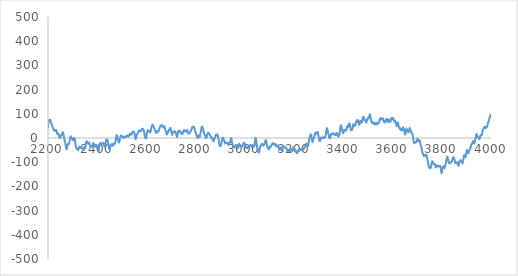
| Category | Series 0 |
|---|---|
| 2200.0 | 41.215 |
| 2200.489 | 45.084 |
| 2200.977 | 50.149 |
| 2201.466 | 56.222 |
| 2201.954 | 61.489 |
| 2202.443 | 64.515 |
| 2202.931 | 66.173 |
| 2203.42 | 68.589 |
| 2203.9080000000004 | 71.45 |
| 2204.397 | 73.194 |
| 2204.8849999999998 | 73.507 |
| 2205.374 | 73.079 |
| 2205.862 | 72.595 |
| 2206.351 | 73.745 |
| 2206.839 | 74.776 |
| 2207.328 | 74.378 |
| 2207.816 | 74.487 |
| 2208.305 | 74.729 |
| 2208.793 | 75.166 |
| 2209.282 | 75.548 |
| 2209.77 | 74.437 |
| 2210.259 | 71.834 |
| 2210.7470000000003 | 69.488 |
| 2211.236 | 67.837 |
| 2211.724 | 65.944 |
| 2212.213 | 64.995 |
| 2212.701 | 64.929 |
| 2213.19 | 63.246 |
| 2213.678 | 61.194 |
| 2214.167 | 59.338 |
| 2214.6549999999997 | 56.926 |
| 2215.144 | 54.896 |
| 2215.632 | 53.374 |
| 2216.121 | 52.734 |
| 2216.609 | 51.164 |
| 2217.098 | 49.851 |
| 2217.5860000000002 | 48.358 |
| 2218.075 | 47.809 |
| 2218.563 | 46.518 |
| 2219.052 | 45.109 |
| 2219.54 | 43.957 |
| 2220.029 | 42.5 |
| 2220.518 | 40.737 |
| 2221.006 | 38.731 |
| 2221.495 | 37.858 |
| 2221.9829999999997 | 37.054 |
| 2222.4719999999998 | 36.445 |
| 2222.96 | 34.468 |
| 2223.449 | 33.56 |
| 2223.937 | 33.034 |
| 2224.426 | 32.828 |
| 2224.9139999999998 | 33.816 |
| 2225.4030000000002 | 32.187 |
| 2225.891 | 30.001 |
| 2226.38 | 29.573 |
| 2226.868 | 30.652 |
| 2227.357 | 31.55 |
| 2227.8450000000003 | 31.83 |
| 2228.3340000000003 | 32.742 |
| 2228.822 | 32.098 |
| 2229.3109999999997 | 32.149 |
| 2229.799 | 33.019 |
| 2230.288 | 32.708 |
| 2230.776 | 31.842 |
| 2231.265 | 30.17 |
| 2231.7529999999997 | 30.379 |
| 2232.242 | 31.721 |
| 2232.73 | 32.132 |
| 2233.219 | 32.549 |
| 2233.707 | 32.036 |
| 2234.196 | 30.092 |
| 2234.684 | 28.717 |
| 2235.1730000000002 | 26.974 |
| 2235.661 | 25.05 |
| 2236.15 | 23.633 |
| 2236.638 | 20.597 |
| 2237.127 | 18.193 |
| 2237.6150000000002 | 17.733 |
| 2238.104 | 16.592 |
| 2238.5919999999996 | 16.458 |
| 2239.081 | 17.33 |
| 2239.569 | 18.084 |
| 2240.058 | 18.22 |
| 2240.547 | 17.174 |
| 2241.035 | 16.885 |
| 2241.524 | 17.29 |
| 2242.012 | 17.889 |
| 2242.501 | 17.744 |
| 2242.989 | 15.856 |
| 2243.478 | 13.725 |
| 2243.966 | 12.224 |
| 2244.455 | 11.231 |
| 2244.943 | 9.556 |
| 2245.4320000000002 | 7.512 |
| 2245.92 | 5.475 |
| 2246.4089999999997 | 3.382 |
| 2246.897 | 1.67 |
| 2247.386 | 0.277 |
| 2247.874 | -0.048 |
| 2248.363 | 0.697 |
| 2248.851 | 0.573 |
| 2249.34 | 1.267 |
| 2249.828 | 2.343 |
| 2250.317 | 2.863 |
| 2250.805 | 4.701 |
| 2251.294 | 6.733 |
| 2251.782 | 9.209 |
| 2252.271 | 10.066 |
| 2252.759 | 9.742 |
| 2253.248 | 10.111 |
| 2253.736 | 10.424 |
| 2254.2250000000004 | 10.681 |
| 2254.713 | 11.381 |
| 2255.2019999999998 | 12.212 |
| 2255.69 | 14.3 |
| 2256.179 | 15.519 |
| 2256.667 | 15.931 |
| 2257.156 | 16.724 |
| 2257.644 | 18.023 |
| 2258.133 | 20.078 |
| 2258.621 | 22.14 |
| 2259.11 | 23.457 |
| 2259.599 | 22.968 |
| 2260.087 | 23.235 |
| 2260.576 | 23.445 |
| 2261.0640000000003 | 22.599 |
| 2261.553 | 21.071 |
| 2262.041 | 18.737 |
| 2262.5299999999997 | 16.846 |
| 2263.018 | 13.586 |
| 2263.507 | 10.144 |
| 2263.995 | 8.146 |
| 2264.484 | 6.403 |
| 2264.9719999999998 | 4.354 |
| 2265.461 | 1.811 |
| 2265.949 | -1.664 |
| 2266.438 | -4.133 |
| 2266.926 | -5.721 |
| 2267.415 | -8.241 |
| 2267.9030000000002 | -10.755 |
| 2268.392 | -12.451 |
| 2268.88 | -13.829 |
| 2269.369 | -15.389 |
| 2269.857 | -18.067 |
| 2270.346 | -20.99 |
| 2270.8340000000003 | -24.345 |
| 2271.323 | -27.569 |
| 2271.8109999999997 | -29.725 |
| 2272.2999999999997 | -32.125 |
| 2272.788 | -34.77 |
| 2273.277 | -37.284 |
| 2273.765 | -40.855 |
| 2274.254 | -43.483 |
| 2274.742 | -45.667 |
| 2275.2309999999998 | -46.596 |
| 2275.719 | -46.645 |
| 2276.208 | -46 |
| 2276.696 | -44.475 |
| 2277.185 | -41.882 |
| 2277.6730000000002 | -38.846 |
| 2278.1620000000003 | -36.929 |
| 2278.65 | -34.319 |
| 2279.139 | -31.016 |
| 2279.6279999999997 | -29.333 |
| 2280.116 | -27.457 |
| 2280.605 | -26.076 |
| 2281.093 | -24.813 |
| 2281.582 | -24.046 |
| 2282.0699999999997 | -24.773 |
| 2282.559 | -25.807 |
| 2283.047 | -24.399 |
| 2283.536 | -23.922 |
| 2284.024 | -23.752 |
| 2284.513 | -24.578 |
| 2285.001 | -23.96 |
| 2285.4900000000002 | -21.775 |
| 2285.978 | -19.584 |
| 2286.467 | -18.638 |
| 2286.955 | -17.249 |
| 2287.444 | -15.792 |
| 2287.9320000000002 | -12.267 |
| 2288.421 | -8.988 |
| 2288.9089999999997 | -6.14 |
| 2289.398 | -3.787 |
| 2289.886 | -1.429 |
| 2290.375 | 0.246 |
| 2290.863 | 2.365 |
| 2291.352 | 4.301 |
| 2291.84 | 6.492 |
| 2292.329 | 6.689 |
| 2292.817 | 6.89 |
| 2293.306 | 5.347 |
| 2293.794 | 4.809 |
| 2294.283 | 4.088 |
| 2294.771 | 3.936 |
| 2295.26 | 2.475 |
| 2295.748 | 1.083 |
| 2296.237 | 1.008 |
| 2296.7250000000004 | -0.688 |
| 2297.214 | -1.627 |
| 2297.7019999999998 | -2.687 |
| 2298.191 | -3.43 |
| 2298.679 | -5.167 |
| 2299.168 | -5.337 |
| 2299.657 | -4.439 |
| 2300.145 | -4.474 |
| 2300.634 | -7.067 |
| 2301.122 | -9.216 |
| 2301.611 | -9.424 |
| 2302.099 | -8.876 |
| 2302.588 | -8.511 |
| 2303.076 | -7.579 |
| 2303.565 | -6.454 |
| 2304.053 | -4.262 |
| 2304.542 | -2.565 |
| 2305.0299999999997 | -1.488 |
| 2305.519 | -1.156 |
| 2306.007 | -0.945 |
| 2306.496 | -0.228 |
| 2306.984 | 0.118 |
| 2307.473 | -0.906 |
| 2307.961 | -1.675 |
| 2308.45 | -2.251 |
| 2308.938 | -5.386 |
| 2309.427 | -10.328 |
| 2309.915 | -15.265 |
| 2310.404 | -17.948 |
| 2310.892 | -20.126 |
| 2311.3810000000003 | -23.549 |
| 2311.869 | -27.217 |
| 2312.358 | -30.193 |
| 2312.846 | -32.415 |
| 2313.335 | -33.757 |
| 2313.823 | -36.031 |
| 2314.312 | -38.801 |
| 2314.7999999999997 | -40.004 |
| 2315.2889999999998 | -40.889 |
| 2315.777 | -41.333 |
| 2316.266 | -42.147 |
| 2316.754 | -44.206 |
| 2317.243 | -45.823 |
| 2317.7309999999998 | -46.81 |
| 2318.2200000000003 | -46.856 |
| 2318.708 | -46.459 |
| 2319.197 | -46.683 |
| 2319.686 | -47.464 |
| 2320.174 | -46.179 |
| 2320.663 | -44.514 |
| 2321.1510000000003 | -44.782 |
| 2321.64 | -46.983 |
| 2322.1279999999997 | -49.179 |
| 2322.6169999999997 | -50.746 |
| 2323.105 | -49.496 |
| 2323.594 | -47.429 |
| 2324.082 | -45.483 |
| 2324.571 | -44.844 |
| 2325.059 | -44.389 |
| 2325.548 | -43.179 |
| 2326.036 | -41.09 |
| 2326.525 | -38.246 |
| 2327.013 | -36.398 |
| 2327.502 | -36.671 |
| 2327.9900000000002 | -37.189 |
| 2328.4790000000003 | -38.14 |
| 2328.967 | -37.9 |
| 2329.456 | -38.467 |
| 2329.944 | -38.718 |
| 2330.433 | -38.402 |
| 2330.921 | -38.706 |
| 2331.41 | -40.069 |
| 2331.898 | -39.802 |
| 2332.3869999999997 | -38.906 |
| 2332.875 | -39.068 |
| 2333.364 | -39.726 |
| 2333.852 | -40.88 |
| 2334.341 | -39.342 |
| 2334.829 | -36.675 |
| 2335.318 | -37.566 |
| 2335.806 | -39.577 |
| 2336.295 | -39.522 |
| 2336.783 | -37.838 |
| 2337.272 | -36.399 |
| 2337.76 | -36.769 |
| 2338.2490000000003 | -37.072 |
| 2338.738 | -37.996 |
| 2339.2259999999997 | -39.416 |
| 2339.715 | -39.394 |
| 2340.203 | -40.181 |
| 2340.692 | -41.963 |
| 2341.18 | -43.616 |
| 2341.669 | -45.265 |
| 2342.157 | -45.973 |
| 2342.646 | -46.676 |
| 2343.134 | -47.438 |
| 2343.623 | -48.196 |
| 2344.111 | -48.012 |
| 2344.6 | -48.324 |
| 2345.088 | -48.382 |
| 2345.577 | -49.561 |
| 2346.065 | -49.298 |
| 2346.554 | -48.032 |
| 2347.042 | -46.323 |
| 2347.531 | -44.799 |
| 2348.019 | -42.708 |
| 2348.508 | -42.175 |
| 2348.996 | -41.701 |
| 2349.485 | -40.223 |
| 2349.973 | -38.116 |
| 2350.462 | -36.38 |
| 2350.95 | -35.139 |
| 2351.439 | -35.083 |
| 2351.927 | -34.148 |
| 2352.416 | -31.833 |
| 2352.904 | -27.828 |
| 2353.393 | -24.068 |
| 2353.8810000000003 | -21.492 |
| 2354.37 | -19.162 |
| 2354.858 | -17.391 |
| 2355.3469999999998 | -16.928 |
| 2355.835 | -16.462 |
| 2356.324 | -15.991 |
| 2356.812 | -14.517 |
| 2357.301 | -13.101 |
| 2357.7889999999998 | -13.87 |
| 2358.278 | -15.259 |
| 2358.767 | -16.457 |
| 2359.255 | -16.588 |
| 2359.744 | -17.091 |
| 2360.232 | -18.59 |
| 2360.721 | -20.086 |
| 2361.209 | -21.077 |
| 2361.6980000000003 | -22.315 |
| 2362.186 | -23.049 |
| 2362.675 | -23.217 |
| 2363.163 | -23.068 |
| 2363.652 | -22.791 |
| 2364.14 | -21.698 |
| 2364.629 | -20.226 |
| 2365.1169999999997 | -19.375 |
| 2365.6059999999998 | -19.52 |
| 2366.094 | -18.725 |
| 2366.583 | -18.925 |
| 2367.071 | -18.747 |
| 2367.56 | -20.128 |
| 2368.048 | -22.818 |
| 2368.5370000000003 | -25.941 |
| 2369.025 | -27.936 |
| 2369.514 | -29.428 |
| 2370.002 | -30.978 |
| 2370.491 | -31.962 |
| 2370.9790000000003 | -33.192 |
| 2371.4680000000003 | -34.357 |
| 2371.956 | -36.08 |
| 2372.4449999999997 | -36.174 |
| 2372.933 | -35.328 |
| 2373.422 | -35.603 |
| 2373.91 | -36.187 |
| 2374.399 | -35.83 |
| 2374.8869999999997 | -35.532 |
| 2375.376 | -36.918 |
| 2375.864 | -37.363 |
| 2376.353 | -37.366 |
| 2376.841 | -36.179 |
| 2377.33 | -35.176 |
| 2377.818 | -34.482 |
| 2378.3070000000002 | -33.347 |
| 2378.7960000000003 | -32.521 |
| 2379.284 | -31.441 |
| 2379.773 | -30.795 |
| 2380.261 | -29.709 |
| 2380.75 | -29.431 |
| 2381.238 | -27.838 |
| 2381.727 | -25.554 |
| 2382.215 | -23.016 |
| 2382.7039999999997 | -21.975 |
| 2383.192 | -21.618 |
| 2383.681 | -21.882 |
| 2384.169 | -21.768 |
| 2384.658 | -21.651 |
| 2385.146 | -21.968 |
| 2385.635 | -23.094 |
| 2386.123 | -24.779 |
| 2386.612 | -28.773 |
| 2387.1 | -31.202 |
| 2387.589 | -32.689 |
| 2388.077 | -33.861 |
| 2388.566 | -35.717 |
| 2389.054 | -35.757 |
| 2389.5429999999997 | -35.732 |
| 2390.031 | -36.203 |
| 2390.52 | -36.858 |
| 2391.008 | -36.51 |
| 2391.497 | -35.283 |
| 2391.985 | -32.929 |
| 2392.474 | -31.759 |
| 2392.962 | -31.085 |
| 2393.451 | -29.908 |
| 2393.939 | -29.54 |
| 2394.428 | -28.982 |
| 2394.916 | -28.545 |
| 2395.405 | -27.543 |
| 2395.893 | -27.538 |
| 2396.382 | -29.404 |
| 2396.87 | -31.704 |
| 2397.359 | -33.377 |
| 2397.8469999999998 | -34.671 |
| 2398.336 | -35.899 |
| 2398.825 | -37.062 |
| 2399.313 | -38.534 |
| 2399.802 | -39.691 |
| 2400.29 | -41.657 |
| 2400.779 | -43.494 |
| 2401.267 | -45.829 |
| 2401.756 | -48.16 |
| 2402.244 | -50.864 |
| 2402.733 | -52.876 |
| 2403.221 | -54.261 |
| 2403.71 | -54.642 |
| 2404.1980000000003 | -55.271 |
| 2404.687 | -55.646 |
| 2405.175 | -55.081 |
| 2405.6639999999998 | -53.825 |
| 2406.152 | -51.066 |
| 2406.641 | -46.804 |
| 2407.129 | -42.539 |
| 2407.618 | -39.271 |
| 2408.1059999999998 | -36.312 |
| 2408.595 | -32.975 |
| 2409.083 | -29.823 |
| 2409.572 | -27.668 |
| 2410.06 | -25.697 |
| 2410.549 | -23.911 |
| 2411.0370000000003 | -23.247 |
| 2411.526 | -22.079 |
| 2412.014 | -21.659 |
| 2412.503 | -21.111 |
| 2412.991 | -20.81 |
| 2413.48 | -21.38 |
| 2413.9680000000003 | -23.198 |
| 2414.457 | -25.076 |
| 2414.9449999999997 | -26.325 |
| 2415.4339999999997 | -25.759 |
| 2415.922 | -24.253 |
| 2416.411 | -23.868 |
| 2416.899 | -25.481 |
| 2417.388 | -25.653 |
| 2417.876 | -25.073 |
| 2418.365 | -24.552 |
| 2418.8540000000003 | -24.528 |
| 2419.342 | -23.876 |
| 2419.831 | -22.596 |
| 2420.319 | -22.376 |
| 2420.808 | -22.653 |
| 2421.2960000000003 | -22.427 |
| 2421.7850000000003 | -22.574 |
| 2422.273 | -22.342 |
| 2422.7619999999997 | -21.733 |
| 2423.25 | -21.933 |
| 2423.739 | -20.818 |
| 2424.227 | -20.137 |
| 2424.716 | -21.079 |
| 2425.2039999999997 | -22.456 |
| 2425.693 | -22.954 |
| 2426.181 | -23.575 |
| 2426.67 | -24.506 |
| 2427.158 | -26.996 |
| 2427.647 | -30.296 |
| 2428.135 | -31.718 |
| 2428.6240000000003 | -32.825 |
| 2429.112 | -33.679 |
| 2429.601 | -35.468 |
| 2430.089 | -36.066 |
| 2430.578 | -34.787 |
| 2431.066 | -32.943 |
| 2431.555 | -31.346 |
| 2432.0429999999997 | -30.933 |
| 2432.532 | -28.143 |
| 2433.02 | -24.038 |
| 2433.509 | -20.555 |
| 2433.997 | -18.569 |
| 2434.486 | -16.393 |
| 2434.974 | -14.214 |
| 2435.463 | -13.345 |
| 2435.951 | -11.349 |
| 2436.44 | -9.599 |
| 2436.928 | -6.973 |
| 2437.417 | -6.593 |
| 2437.906 | -6.586 |
| 2438.3940000000002 | -7.388 |
| 2438.883 | -7.751 |
| 2439.371 | -6.61 |
| 2439.8599999999997 | -6.843 |
| 2440.348 | -7.822 |
| 2440.837 | -8.986 |
| 2441.325 | -9.898 |
| 2441.814 | -10.807 |
| 2442.302 | -11.714 |
| 2442.791 | -13.743 |
| 2443.279 | -16.456 |
| 2443.768 | -18.668 |
| 2444.256 | -22.314 |
| 2444.745 | -26.645 |
| 2445.233 | -29.661 |
| 2445.722 | -32.924 |
| 2446.21 | -36.435 |
| 2446.699 | -39.255 |
| 2447.187 | -41.511 |
| 2447.676 | -43.764 |
| 2448.1639999999998 | -45.015 |
| 2448.653 | -43.95 |
| 2449.141 | -42.633 |
| 2449.63 | -41.876 |
| 2450.118 | -42.366 |
| 2450.607 | -42.104 |
| 2451.095 | -41.84 |
| 2451.584 | -41.573 |
| 2452.072 | -41.178 |
| 2452.561 | -40.281 |
| 2453.049 | -37.881 |
| 2453.538 | -36.104 |
| 2454.026 | -34.012 |
| 2454.5150000000003 | -32.792 |
| 2455.003 | -31.507 |
| 2455.492 | -30.595 |
| 2455.98 | -28.493 |
| 2456.469 | -26.764 |
| 2456.957 | -26.282 |
| 2457.446 | -26.172 |
| 2457.935 | -26.498 |
| 2458.423 | -26.196 |
| 2458.912 | -25.892 |
| 2459.4 | -26.023 |
| 2459.889 | -25.964 |
| 2460.377 | -27.34 |
| 2460.866 | -29.026 |
| 2461.3540000000003 | -29.147 |
| 2461.843 | -29.641 |
| 2462.331 | -30.695 |
| 2462.82 | -31.746 |
| 2463.308 | -32.295 |
| 2463.797 | -32.592 |
| 2464.2850000000003 | -31.948 |
| 2464.774 | -30.615 |
| 2465.2619999999997 | -29.155 |
| 2465.7509999999997 | -28.192 |
| 2466.239 | -26.414 |
| 2466.728 | -24.384 |
| 2467.216 | -22.852 |
| 2467.705 | -21.942 |
| 2468.193 | -21.53 |
| 2468.682 | -21.241 |
| 2469.17 | -22.011 |
| 2469.659 | -22.467 |
| 2470.147 | -22.796 |
| 2470.636 | -22.872 |
| 2471.1240000000003 | -24.196 |
| 2471.6130000000003 | -23.33 |
| 2472.101 | -21.524 |
| 2472.5899999999997 | -19.966 |
| 2473.078 | -18.406 |
| 2473.567 | -17.719 |
| 2474.055 | -16.091 |
| 2474.544 | -13.274 |
| 2475.032 | -9.767 |
| 2475.5209999999997 | -6.008 |
| 2476.009 | -2.434 |
| 2476.498 | 0.517 |
| 2476.986 | 1.721 |
| 2477.475 | 3.864 |
| 2477.964 | 6.509 |
| 2478.452 | 9.845 |
| 2478.9410000000003 | 11.807 |
| 2479.429 | 11.772 |
| 2479.918 | 11.426 |
| 2480.406 | 9.895 |
| 2480.895 | 7.554 |
| 2481.383 | 5.528 |
| 2481.872 | 4.254 |
| 2482.3599999999997 | 1.357 |
| 2482.849 | -1.788 |
| 2483.337 | -4.118 |
| 2483.826 | -5.258 |
| 2484.314 | -6.771 |
| 2484.803 | -8.845 |
| 2485.291 | -11.353 |
| 2485.78 | -12.235 |
| 2486.268 | -12.989 |
| 2486.757 | -14.367 |
| 2487.245 | -16.742 |
| 2487.734 | -18.49 |
| 2488.222 | -18.735 |
| 2488.7110000000002 | -17.666 |
| 2489.199 | -16.158 |
| 2489.688 | -15.397 |
| 2490.176 | -14.509 |
| 2490.665 | -12.244 |
| 2491.153 | -9.039 |
| 2491.642 | -5.77 |
| 2492.13 | -3.374 |
| 2492.619 | -0.725 |
| 2493.107 | 1.175 |
| 2493.596 | 3.391 |
| 2494.084 | 4.046 |
| 2494.573 | 5.578 |
| 2495.061 | 6.862 |
| 2495.55 | 8.773 |
| 2496.038 | 9.874 |
| 2496.527 | 9.727 |
| 2497.0150000000003 | 10.019 |
| 2497.504 | 10.064 |
| 2497.993 | 9.985 |
| 2498.4809999999998 | 9.909 |
| 2498.97 | 8.897 |
| 2499.458 | 7.263 |
| 2499.947 | 7.568 |
| 2500.435 | 8.75 |
| 2500.924 | 9.309 |
| 2501.412 | 7.62 |
| 2501.901 | 5.621 |
| 2502.389 | 4.123 |
| 2502.878 | 4.065 |
| 2503.366 | 4.76 |
| 2503.855 | 4.831 |
| 2504.343 | 3.154 |
| 2504.8320000000003 | 1.605 |
| 2505.32 | 1.432 |
| 2505.809 | 2.949 |
| 2506.297 | 3.093 |
| 2506.786 | 2.802 |
| 2507.274 | 2.95 |
| 2507.763 | 4.099 |
| 2508.2509999999997 | 4.626 |
| 2508.74 | 4.03 |
| 2509.228 | 5.186 |
| 2509.717 | 5.219 |
| 2510.205 | 5.004 |
| 2510.694 | 4.041 |
| 2511.182 | 3.33 |
| 2511.6710000000003 | 2.308 |
| 2512.159 | 1.601 |
| 2512.648 | 1.584 |
| 2513.136 | 2.443 |
| 2513.625 | 2.992 |
| 2514.1130000000003 | 2.855 |
| 2514.602 | 2.658 |
| 2515.0899999999997 | 2.837 |
| 2515.5789999999997 | 4.269 |
| 2516.067 | 5.702 |
| 2516.556 | 6.2 |
| 2517.045 | 7.45 |
| 2517.533 | 7.389 |
| 2518.022 | 7.893 |
| 2518.51 | 8.211 |
| 2518.999 | 7.719 |
| 2519.487 | 7.041 |
| 2519.976 | 8.177 |
| 2520.464 | 9.941 |
| 2520.953 | 10.519 |
| 2521.4410000000003 | 9.848 |
| 2521.9300000000003 | 9.055 |
| 2522.418 | 9.513 |
| 2522.9069999999997 | 9.974 |
| 2523.395 | 9.749 |
| 2523.884 | 8.963 |
| 2524.372 | 8.554 |
| 2524.861 | 8.459 |
| 2525.349 | 7.992 |
| 2525.8379999999997 | 6.463 |
| 2526.326 | 6.124 |
| 2526.815 | 6.037 |
| 2527.303 | 6.202 |
| 2527.792 | 7.306 |
| 2528.28 | 7.225 |
| 2528.7690000000002 | 8.333 |
| 2529.257 | 10.443 |
| 2529.746 | 11.679 |
| 2530.234 | 11.293 |
| 2530.723 | 11.658 |
| 2531.2110000000002 | 12.65 |
| 2531.7 | 13.582 |
| 2532.188 | 14.765 |
| 2532.6769999999997 | 16.138 |
| 2533.165 | 18.137 |
| 2533.654 | 18.076 |
| 2534.142 | 16.955 |
| 2534.631 | 16.085 |
| 2535.119 | 15.654 |
| 2535.608 | 15.1 |
| 2536.096 | 15.11 |
| 2536.585 | 13.81 |
| 2537.074 | 13.824 |
| 2537.562 | 14.778 |
| 2538.051 | 16.67 |
| 2538.539 | 17.065 |
| 2539.0280000000002 | 15.774 |
| 2539.516 | 15.172 |
| 2540.005 | 16.322 |
| 2540.493 | 18.223 |
| 2540.982 | 19.752 |
| 2541.47 | 20.595 |
| 2541.959 | 20.689 |
| 2542.447 | 21.848 |
| 2542.936 | 23.258 |
| 2543.424 | 23.858 |
| 2543.913 | 23.522 |
| 2544.401 | 23.376 |
| 2544.89 | 24.543 |
| 2545.378 | 25.4 |
| 2545.867 | 25.446 |
| 2546.355 | 25.432 |
| 2546.844 | 24.981 |
| 2547.3320000000003 | 24.22 |
| 2547.821 | 24.836 |
| 2548.309 | 25.141 |
| 2548.798 | 26.073 |
| 2549.286 | 26.256 |
| 2549.775 | 24.254 |
| 2550.263 | 22.565 |
| 2550.752 | 20.567 |
| 2551.24 | 18.882 |
| 2551.729 | 17.449 |
| 2552.217 | 14.455 |
| 2552.706 | 10.526 |
| 2553.194 | 6.91 |
| 2553.683 | 3.234 |
| 2554.1710000000003 | 0.81 |
| 2554.66 | -0.988 |
| 2555.148 | -3.221 |
| 2555.637 | -4.39 |
| 2556.125 | -4.37 |
| 2556.614 | -3.849 |
| 2557.103 | -3.513 |
| 2557.591 | -1.175 |
| 2558.08 | 1.164 |
| 2558.5679999999998 | 3.38 |
| 2559.057 | 5.348 |
| 2559.545 | 8.254 |
| 2560.034 | 11.225 |
| 2560.5220000000004 | 13.198 |
| 2561.0109999999995 | 13.797 |
| 2561.499 | 14.336 |
| 2561.9880000000003 | 14.501 |
| 2562.4759999999997 | 16.418 |
| 2562.9649999999997 | 17.149 |
| 2563.453 | 17.944 |
| 2563.942 | 19.804 |
| 2564.43 | 20.79 |
| 2564.919 | 21.528 |
| 2565.407 | 21.892 |
| 2565.896 | 23.32 |
| 2566.384 | 25.063 |
| 2566.873 | 26.245 |
| 2567.3610000000003 | 25.866 |
| 2567.8500000000004 | 25.989 |
| 2568.3379999999997 | 27.175 |
| 2568.827 | 29.801 |
| 2569.3150000000005 | 31.241 |
| 2569.8039999999996 | 30.058 |
| 2570.292 | 29.439 |
| 2570.781 | 29.821 |
| 2571.269 | 30.518 |
| 2571.758 | 30.591 |
| 2572.246 | 29.603 |
| 2572.735 | 27.93 |
| 2573.223 | 27.321 |
| 2573.712 | 27.713 |
| 2574.2000000000003 | 28.357 |
| 2574.6890000000003 | 28.252 |
| 2575.1769999999997 | 27.649 |
| 2575.666 | 28.048 |
| 2576.1540000000005 | 29.073 |
| 2576.643 | 30.037 |
| 2577.1319999999996 | 29.191 |
| 2577.62 | 27.721 |
| 2578.109 | 27.94 |
| 2578.5969999999998 | 29.474 |
| 2579.086 | 30.508 |
| 2579.574 | 30.795 |
| 2580.063 | 32.958 |
| 2580.551 | 35.873 |
| 2581.04 | 37.476 |
| 2581.5280000000002 | 37.832 |
| 2582.0170000000003 | 38.314 |
| 2582.505 | 38.86 |
| 2582.9939999999997 | 38.407 |
| 2583.482 | 37.457 |
| 2583.9710000000005 | 37.195 |
| 2584.459 | 37.06 |
| 2584.948 | 37.551 |
| 2585.436 | 37.294 |
| 2585.9249999999997 | 36.789 |
| 2586.413 | 35.722 |
| 2586.902 | 35.408 |
| 2587.39 | 35.969 |
| 2587.879 | 34.47 |
| 2588.367 | 32.285 |
| 2588.856 | 30.101 |
| 2589.344 | 29.044 |
| 2589.8329999999996 | 28.426 |
| 2590.321 | 25.498 |
| 2590.8100000000004 | 22.383 |
| 2591.298 | 20.144 |
| 2591.787 | 16.908 |
| 2592.275 | 12.235 |
| 2592.764 | 10.001 |
| 2593.252 | 7.957 |
| 2593.741 | 5.851 |
| 2594.2290000000003 | 4.122 |
| 2594.718 | 2.207 |
| 2595.206 | 0.919 |
| 2595.695 | 0.319 |
| 2596.183 | -0.466 |
| 2596.6719999999996 | -1.125 |
| 2597.161 | -2.22 |
| 2597.6490000000003 | -1.876 |
| 2598.138 | -1.593 |
| 2598.6259999999997 | -0.995 |
| 2599.115 | 0.104 |
| 2599.603 | 2.266 |
| 2600.092 | 4.806 |
| 2600.58 | 9.159 |
| 2601.069 | 14.014 |
| 2601.5570000000002 | 17.62 |
| 2602.0460000000003 | 20.728 |
| 2602.534 | 22.587 |
| 2603.023 | 23.011 |
| 2603.5109999999995 | 25.123 |
| 2604.0 | 27.862 |
| 2604.4880000000003 | 31.227 |
| 2604.977 | 32.657 |
| 2605.4649999999997 | 31.963 |
| 2605.9539999999997 | 31.27 |
| 2606.442 | 31.079 |
| 2606.931 | 31.327 |
| 2607.419 | 30.326 |
| 2607.908 | 28.952 |
| 2608.396 | 28.83 |
| 2608.885 | 28.834 |
| 2609.373 | 29.276 |
| 2609.862 | 29.283 |
| 2610.3500000000004 | 27.854 |
| 2610.8390000000004 | 26.864 |
| 2611.327 | 27.188 |
| 2611.816 | 26.826 |
| 2612.3039999999996 | 25.215 |
| 2612.7929999999997 | 24.231 |
| 2613.281 | 25.123 |
| 2613.77 | 25.141 |
| 2614.258 | 23.724 |
| 2614.747 | 22.996 |
| 2615.235 | 24.206 |
| 2615.724 | 25.606 |
| 2616.213 | 25.945 |
| 2616.701 | 25.722 |
| 2617.19 | 26.564 |
| 2617.6780000000003 | 27.907 |
| 2618.1670000000004 | 31.376 |
| 2618.6549999999997 | 35.472 |
| 2619.1440000000002 | 37.819 |
| 2619.6319999999996 | 40.793 |
| 2620.1209999999996 | 43.706 |
| 2620.609 | 45.87 |
| 2621.098 | 46.161 |
| 2621.586 | 46.953 |
| 2622.075 | 49.809 |
| 2622.563 | 51.854 |
| 2623.052 | 52.526 |
| 2623.54 | 53.636 |
| 2624.029 | 54.436 |
| 2624.5170000000003 | 54.674 |
| 2625.0060000000003 | 53.914 |
| 2625.4939999999997 | 51.28 |
| 2625.983 | 49.835 |
| 2626.4710000000005 | 50.704 |
| 2626.96 | 51.45 |
| 2627.448 | 51.384 |
| 2627.937 | 49.82 |
| 2628.4249999999997 | 48.383 |
| 2628.9139999999998 | 47.884 |
| 2629.402 | 47.575 |
| 2629.891 | 45.954 |
| 2630.379 | 43.897 |
| 2630.868 | 41.841 |
| 2631.356 | 41.475 |
| 2631.8450000000003 | 41.485 |
| 2632.3329999999996 | 40.809 |
| 2632.822 | 38.947 |
| 2633.3100000000004 | 35.773 |
| 2633.799 | 33.789 |
| 2634.287 | 32.618 |
| 2634.776 | 31.824 |
| 2635.264 | 31.032 |
| 2635.753 | 30.491 |
| 2636.2419999999997 | 29.889 |
| 2636.73 | 29.163 |
| 2637.219 | 27.376 |
| 2637.707 | 25.965 |
| 2638.196 | 24.494 |
| 2638.684 | 22.899 |
| 2639.1730000000002 | 20.93 |
| 2639.661 | 20.15 |
| 2640.1499999999996 | 20.809 |
| 2640.638 | 22.407 |
| 2641.1270000000004 | 23.132 |
| 2641.615 | 22.982 |
| 2642.104 | 22.46 |
| 2642.592 | 23.876 |
| 2643.081 | 26.168 |
| 2643.569 | 27.712 |
| 2644.058 | 27.445 |
| 2644.5460000000003 | 28.117 |
| 2645.035 | 28.728 |
| 2645.523 | 27.84 |
| 2646.012 | 26.516 |
| 2646.5 | 27.506 |
| 2646.9889999999996 | 27.747 |
| 2647.477 | 28.177 |
| 2647.9660000000003 | 26.359 |
| 2648.4539999999997 | 26.917 |
| 2648.9429999999998 | 29.164 |
| 2649.431 | 30.474 |
| 2649.92 | 30.224 |
| 2650.408 | 29.663 |
| 2650.897 | 30.165 |
| 2651.385 | 32.419 |
| 2651.8740000000003 | 35.799 |
| 2652.362 | 38.181 |
| 2652.851 | 39.564 |
| 2653.3390000000004 | 40.261 |
| 2653.8279999999995 | 42.146 |
| 2654.316 | 44.284 |
| 2654.8050000000003 | 45.672 |
| 2655.2929999999997 | 47.187 |
| 2655.7819999999997 | 48.078 |
| 2656.2709999999997 | 48.284 |
| 2656.759 | 48.553 |
| 2657.248 | 49.323 |
| 2657.736 | 51.033 |
| 2658.225 | 52.493 |
| 2658.713 | 53.081 |
| 2659.202 | 52.169 |
| 2659.69 | 51.196 |
| 2660.179 | 51.475 |
| 2660.6670000000004 | 52.255 |
| 2661.156 | 51.912 |
| 2661.6440000000002 | 51.195 |
| 2662.133 | 51.729 |
| 2662.6209999999996 | 53.077 |
| 2663.1099999999997 | 53.239 |
| 2663.598 | 52.653 |
| 2664.087 | 51.942 |
| 2664.575 | 50.546 |
| 2665.064 | 49.151 |
| 2665.552 | 47.445 |
| 2666.041 | 45.928 |
| 2666.529 | 45.724 |
| 2667.018 | 46.585 |
| 2667.5060000000003 | 46.822 |
| 2667.9950000000003 | 45.31 |
| 2668.483 | 43.362 |
| 2668.9719999999998 | 43.291 |
| 2669.46 | 44.158 |
| 2669.9489999999996 | 45.089 |
| 2670.437 | 45.959 |
| 2670.926 | 45.143 |
| 2671.4139999999998 | 44.516 |
| 2671.903 | 45.64 |
| 2672.391 | 47.578 |
| 2672.88 | 48.705 |
| 2673.368 | 47.646 |
| 2673.857 | 45.838 |
| 2674.3450000000003 | 44.531 |
| 2674.8340000000003 | 41.664 |
| 2675.322 | 38.797 |
| 2675.8109999999997 | 36.745 |
| 2676.3 | 35.194 |
| 2676.7880000000005 | 33.707 |
| 2677.277 | 33.408 |
| 2677.765 | 32.986 |
| 2678.254 | 31.378 |
| 2678.7419999999997 | 29.209 |
| 2679.2309999999998 | 27.291 |
| 2679.719 | 24.874 |
| 2680.208 | 21.522 |
| 2680.696 | 20.045 |
| 2681.185 | 18.508 |
| 2681.6730000000002 | 16.159 |
| 2682.1620000000003 | 14.624 |
| 2682.6499999999996 | 15.091 |
| 2683.139 | 15.496 |
| 2683.6270000000004 | 15.278 |
| 2684.116 | 15.311 |
| 2684.604 | 16.845 |
| 2685.093 | 20.069 |
| 2685.581 | 21.606 |
| 2686.07 | 21.707 |
| 2686.558 | 21.872 |
| 2687.047 | 23.975 |
| 2687.535 | 26.143 |
| 2688.024 | 25.499 |
| 2688.512 | 24.482 |
| 2689.001 | 25.279 |
| 2689.4889999999996 | 27.264 |
| 2689.978 | 28.626 |
| 2690.4660000000003 | 29.552 |
| 2690.955 | 31.354 |
| 2691.4429999999998 | 33.282 |
| 2691.932 | 34.149 |
| 2692.42 | 34.642 |
| 2692.909 | 34.95 |
| 2693.397 | 34.821 |
| 2693.886 | 35.256 |
| 2694.3740000000003 | 36.38 |
| 2694.8630000000003 | 36.943 |
| 2695.352 | 37.007 |
| 2695.84 | 37.947 |
| 2696.329 | 39.577 |
| 2696.817 | 41.52 |
| 2697.3059999999996 | 41.589 |
| 2697.794 | 41.16 |
| 2698.2830000000004 | 39.732 |
| 2698.7709999999997 | 38.743 |
| 2699.2599999999998 | 36.693 |
| 2699.748 | 34.894 |
| 2700.237 | 31.784 |
| 2700.725 | 29.238 |
| 2701.214 | 27.568 |
| 2701.702 | 25.337 |
| 2702.1910000000003 | 23.233 |
| 2702.679 | 20.504 |
| 2703.168 | 17.777 |
| 2703.656 | 15.114 |
| 2704.1449999999995 | 12.952 |
| 2704.633 | 12.792 |
| 2705.1220000000003 | 14.57 |
| 2705.6099999999997 | 17.1 |
| 2706.0989999999997 | 19.444 |
| 2706.587 | 20.539 |
| 2707.076 | 21.572 |
| 2707.564 | 22.545 |
| 2708.053 | 22.394 |
| 2708.541 | 24.119 |
| 2709.03 | 24.783 |
| 2709.518 | 24.511 |
| 2710.007 | 23.741 |
| 2710.4950000000003 | 23.721 |
| 2710.9840000000004 | 24.453 |
| 2711.4719999999998 | 24.749 |
| 2711.9610000000002 | 24.796 |
| 2712.4489999999996 | 24.407 |
| 2712.9379999999996 | 24.644 |
| 2713.426 | 25.946 |
| 2713.915 | 27.748 |
| 2714.403 | 27.552 |
| 2714.892 | 26.857 |
| 2715.381 | 26.914 |
| 2715.869 | 27.659 |
| 2716.358 | 27.281 |
| 2716.846 | 26.466 |
| 2717.335 | 25.903 |
| 2717.8230000000003 | 25.341 |
| 2718.3120000000004 | 24.906 |
| 2718.8 | 23.346 |
| 2719.2889999999998 | 20.664 |
| 2719.777 | 18.607 |
| 2720.2659999999996 | 18.177 |
| 2720.754 | 17.248 |
| 2721.243 | 14.508 |
| 2721.7309999999998 | 11.332 |
| 2722.22 | 9.595 |
| 2722.708 | 8.546 |
| 2723.197 | 7.374 |
| 2723.685 | 6.266 |
| 2724.174 | 4.909 |
| 2724.6620000000003 | 4.116 |
| 2725.1510000000003 | 5.699 |
| 2725.639 | 8.909 |
| 2726.1279999999997 | 12.682 |
| 2726.616 | 16.144 |
| 2727.1050000000005 | 17.858 |
| 2727.593 | 20.198 |
| 2728.082 | 22.726 |
| 2728.57 | 25.194 |
| 2729.0589999999997 | 27.6 |
| 2729.547 | 28.758 |
| 2730.036 | 29.292 |
| 2730.524 | 29.64 |
| 2731.013 | 29.677 |
| 2731.501 | 28.652 |
| 2731.9900000000002 | 27.067 |
| 2732.478 | 27.295 |
| 2732.9669999999996 | 27.212 |
| 2733.455 | 27.318 |
| 2733.9440000000004 | 27.988 |
| 2734.432 | 29.221 |
| 2734.921 | 29.894 |
| 2735.41 | 29.38 |
| 2735.898 | 27.93 |
| 2736.3869999999997 | 26.794 |
| 2736.875 | 26.284 |
| 2737.364 | 26.338 |
| 2737.852 | 25.706 |
| 2738.341 | 24.451 |
| 2738.829 | 21.759 |
| 2739.318 | 20.881 |
| 2739.8059999999996 | 21.442 |
| 2740.295 | 23.004 |
| 2740.7830000000004 | 23.067 |
| 2741.272 | 21.319 |
| 2741.7599999999998 | 19.261 |
| 2742.249 | 17.891 |
| 2742.737 | 19.272 |
| 2743.226 | 20.78 |
| 2743.714 | 19.414 |
| 2744.203 | 16.549 |
| 2744.6910000000003 | 16.248 |
| 2745.18 | 16.886 |
| 2745.668 | 16.838 |
| 2746.157 | 16.729 |
| 2746.6449999999995 | 16.871 |
| 2747.134 | 18.139 |
| 2747.6220000000003 | 19.721 |
| 2748.111 | 20.93 |
| 2748.5989999999997 | 21.89 |
| 2749.0879999999997 | 22.351 |
| 2749.576 | 23.439 |
| 2750.065 | 26.84 |
| 2750.553 | 28.618 |
| 2751.042 | 29.709 |
| 2751.53 | 30.615 |
| 2752.0190000000002 | 31.647 |
| 2752.507 | 32.617 |
| 2752.996 | 32.464 |
| 2753.4840000000004 | 31.75 |
| 2753.973 | 30.6 |
| 2754.4610000000002 | 30.076 |
| 2754.95 | 29.803 |
| 2755.4390000000003 | 28.407 |
| 2755.9269999999997 | 28.762 |
| 2756.4159999999997 | 28.68 |
| 2756.904 | 28.663 |
| 2757.393 | 28.522 |
| 2757.881 | 28.133 |
| 2758.37 | 28.682 |
| 2758.858 | 28.482 |
| 2759.347 | 28.534 |
| 2759.835 | 27.088 |
| 2760.324 | 26.83 |
| 2760.8120000000004 | 28.636 |
| 2761.3010000000004 | 30.005 |
| 2761.7889999999998 | 29.689 |
| 2762.2780000000002 | 29.249 |
| 2762.7659999999996 | 29.998 |
| 2763.2549999999997 | 31.873 |
| 2763.743 | 32.812 |
| 2764.232 | 31.19 |
| 2764.72 | 31.132 |
| 2765.209 | 32.512 |
| 2765.697 | 33.519 |
| 2766.186 | 32.84 |
| 2766.674 | 30.162 |
| 2767.163 | 27.861 |
| 2767.6510000000003 | 25.811 |
| 2768.1400000000003 | 24.324 |
| 2768.6279999999997 | 24.527 |
| 2769.117 | 23.981 |
| 2769.6050000000005 | 23.436 |
| 2770.094 | 21.018 |
| 2770.582 | 19.35 |
| 2771.071 | 18.685 |
| 2771.5589999999997 | 20.833 |
| 2772.048 | 21.795 |
| 2772.536 | 20.946 |
| 2773.025 | 19.035 |
| 2773.513 | 19.876 |
| 2774.002 | 21.031 |
| 2774.4900000000002 | 21.125 |
| 2774.9790000000003 | 20.345 |
| 2775.4680000000003 | 20.629 |
| 2775.956 | 21.665 |
| 2776.4449999999997 | 23.576 |
| 2776.933 | 23.427 |
| 2777.4220000000005 | 24.154 |
| 2777.91 | 25.069 |
| 2778.399 | 25.987 |
| 2778.8869999999997 | 26.842 |
| 2779.3759999999997 | 28.075 |
| 2779.864 | 28.933 |
| 2780.353 | 28.981 |
| 2780.841 | 28.842 |
| 2781.33 | 29.08 |
| 2781.818 | 30.319 |
| 2782.3070000000002 | 32.56 |
| 2782.795 | 35.052 |
| 2783.2839999999997 | 37.42 |
| 2783.772 | 39.227 |
| 2784.2610000000004 | 40.785 |
| 2784.749 | 42.47 |
| 2785.238 | 43.031 |
| 2785.726 | 42.906 |
| 2786.215 | 44.47 |
| 2786.703 | 45.16 |
| 2787.192 | 45.977 |
| 2787.68 | 45.17 |
| 2788.169 | 43.739 |
| 2788.657 | 43.872 |
| 2789.146 | 44.632 |
| 2789.634 | 44.455 |
| 2790.1229999999996 | 43.655 |
| 2790.611 | 43.044 |
| 2791.1000000000004 | 44.496 |
| 2791.5879999999997 | 45.7 |
| 2792.0769999999998 | 46.843 |
| 2792.565 | 47.237 |
| 2793.054 | 45.82 |
| 2793.542 | 44.342 |
| 2794.031 | 42.74 |
| 2794.52 | 41.452 |
| 2795.0080000000003 | 40.353 |
| 2795.497 | 38.568 |
| 2795.985 | 36.472 |
| 2796.474 | 35.127 |
| 2796.9619999999995 | 33.283 |
| 2797.451 | 31.066 |
| 2797.9390000000003 | 29.225 |
| 2798.428 | 27.136 |
| 2798.9159999999997 | 24.548 |
| 2799.4049999999997 | 22.274 |
| 2799.893 | 21.063 |
| 2800.382 | 20.104 |
| 2800.87 | 18.897 |
| 2801.359 | 17.566 |
| 2801.847 | 16.548 |
| 2802.3360000000002 | 15.345 |
| 2802.824 | 13.018 |
| 2803.313 | 11.255 |
| 2803.8010000000004 | 11.118 |
| 2804.29 | 11.108 |
| 2804.7780000000002 | 10.036 |
| 2805.267 | 6.716 |
| 2805.7549999999997 | 4.085 |
| 2806.2439999999997 | 2.955 |
| 2806.732 | 2.889 |
| 2807.221 | 1.512 |
| 2807.709 | -0.427 |
| 2808.198 | 0.074 |
| 2808.686 | 2.451 |
| 2809.175 | 4.142 |
| 2809.663 | 5.022 |
| 2810.152 | 4.528 |
| 2810.6400000000003 | 3.973 |
| 2811.1290000000004 | 5.607 |
| 2811.617 | 8.555 |
| 2812.1059999999998 | 10.317 |
| 2812.594 | 10.017 |
| 2813.0829999999996 | 9.282 |
| 2813.571 | 8.485 |
| 2814.06 | 7.565 |
| 2814.549 | 6.646 |
| 2815.037 | 5.416 |
| 2815.526 | 4.875 |
| 2816.014 | 5.023 |
| 2816.503 | 5.922 |
| 2816.991 | 6.198 |
| 2817.48 | 6.975 |
| 2817.9680000000003 | 8.941 |
| 2818.4570000000003 | 11.783 |
| 2818.9449999999997 | 15.064 |
| 2819.434 | 18.784 |
| 2819.9220000000005 | 21.318 |
| 2820.4109999999996 | 24.604 |
| 2820.899 | 27.453 |
| 2821.388 | 29.804 |
| 2821.8759999999997 | 31.718 |
| 2822.365 | 32.947 |
| 2822.853 | 36.489 |
| 2823.342 | 39.72 |
| 2823.83 | 43.265 |
| 2824.319 | 45.437 |
| 2824.8070000000002 | 45.797 |
| 2825.2960000000003 | 46.409 |
| 2825.7839999999997 | 47.21 |
| 2826.273 | 46.887 |
| 2826.7610000000004 | 45.441 |
| 2827.25 | 44.371 |
| 2827.738 | 43.302 |
| 2828.227 | 42.86 |
| 2828.715 | 42.357 |
| 2829.2039999999997 | 41.355 |
| 2829.692 | 39.729 |
| 2830.181 | 37.293 |
| 2830.669 | 35.17 |
| 2831.158 | 32.549 |
| 2831.646 | 29.616 |
| 2832.135 | 26.56 |
| 2832.6229999999996 | 24.068 |
| 2833.112 | 22.265 |
| 2833.6000000000004 | 20.276 |
| 2834.089 | 18.663 |
| 2834.5780000000004 | 17.489 |
| 2835.066 | 17.004 |
| 2835.555 | 15.896 |
| 2836.043 | 15.038 |
| 2836.532 | 13.995 |
| 2837.02 | 12.391 |
| 2837.509 | 11.288 |
| 2837.997 | 10.311 |
| 2838.486 | 9.774 |
| 2838.974 | 10.55 |
| 2839.463 | 9.015 |
| 2839.951 | 6.232 |
| 2840.4399999999996 | 4.075 |
| 2840.928 | 2.419 |
| 2841.4170000000004 | 1.953 |
| 2841.9049999999997 | 1.3 |
| 2842.394 | 0.711 |
| 2842.882 | -0.314 |
| 2843.371 | 0.226 |
| 2843.859 | 2.016 |
| 2844.348 | 4.62 |
| 2844.8360000000002 | 6.476 |
| 2845.3250000000003 | 6.334 |
| 2845.813 | 7.442 |
| 2846.302 | 10.115 |
| 2846.79 | 12.414 |
| 2847.2789999999995 | 14.152 |
| 2847.767 | 15.329 |
| 2848.2560000000003 | 16.507 |
| 2848.7439999999997 | 18.499 |
| 2849.2329999999997 | 19.243 |
| 2849.721 | 18.863 |
| 2850.21 | 19.11 |
| 2850.698 | 20.67 |
| 2851.187 | 21.544 |
| 2851.675 | 20.92 |
| 2852.164 | 19.423 |
| 2852.652 | 18.176 |
| 2853.141 | 17.931 |
| 2853.6290000000004 | 18.25 |
| 2854.1180000000004 | 18.571 |
| 2854.607 | 18.205 |
| 2855.0950000000003 | 17.216 |
| 2855.584 | 15.541 |
| 2856.0719999999997 | 14.305 |
| 2856.5609999999997 | 13.507 |
| 2857.049 | 13.399 |
| 2857.538 | 13.292 |
| 2858.026 | 13.186 |
| 2858.515 | 11.582 |
| 2859.003 | 11.73 |
| 2859.492 | 11.253 |
| 2859.98 | 9.529 |
| 2860.469 | 7.805 |
| 2860.9570000000003 | 5.833 |
| 2861.4460000000004 | 3.863 |
| 2861.934 | 3.081 |
| 2862.423 | 2.301 |
| 2862.9109999999996 | 1.148 |
| 2863.3999999999996 | 0.621 |
| 2863.888 | 0.157 |
| 2864.377 | 0.258 |
| 2864.865 | -0.015 |
| 2865.354 | -0.474 |
| 2865.842 | 1.006 |
| 2866.331 | 2.113 |
| 2866.819 | 1.783 |
| 2867.308 | 0.018 |
| 2867.7960000000003 | -2.434 |
| 2868.2850000000003 | -3.072 |
| 2868.773 | -2.958 |
| 2869.2619999999997 | -4.843 |
| 2869.75 | -8.726 |
| 2870.2390000000005 | -10.733 |
| 2870.727 | -11.176 |
| 2871.216 | -10.742 |
| 2871.7039999999997 | -11.307 |
| 2872.1929999999998 | -12.621 |
| 2872.681 | -12.995 |
| 2873.17 | -12.744 |
| 2873.659 | -12.678 |
| 2874.147 | -11.611 |
| 2874.636 | -9.229 |
| 2875.1240000000003 | -6.222 |
| 2875.6130000000003 | -3.4 |
| 2876.1009999999997 | -2.889 |
| 2876.59 | -2.377 |
| 2877.0780000000004 | -1.801 |
| 2877.567 | -0.786 |
| 2878.055 | 0.605 |
| 2878.544 | 1.248 |
| 2879.032 | 1.767 |
| 2879.5209999999997 | 3.663 |
| 2880.009 | 5.81 |
| 2880.498 | 7.209 |
| 2880.986 | 7.984 |
| 2881.475 | 9.324 |
| 2881.963 | 11.477 |
| 2882.452 | 13.006 |
| 2882.9399999999996 | 14.225 |
| 2883.429 | 14.695 |
| 2883.9170000000004 | 13.979 |
| 2884.406 | 13.389 |
| 2884.894 | 14.551 |
| 2885.383 | 15.215 |
| 2885.871 | 14.755 |
| 2886.36 | 13.984 |
| 2886.848 | 13.901 |
| 2887.337 | 13.758 |
| 2887.8250000000003 | 13.429 |
| 2888.314 | 12.851 |
| 2888.802 | 12.837 |
| 2889.291 | 12.825 |
| 2889.7789999999995 | 11.189 |
| 2890.268 | 8.993 |
| 2890.7560000000003 | 6.297 |
| 2891.245 | 4.291 |
| 2891.7329999999997 | 2.973 |
| 2892.2219999999998 | 1.032 |
| 2892.71 | -1.907 |
| 2893.199 | -5.345 |
| 2893.688 | -8.782 |
| 2894.176 | -12.717 |
| 2894.665 | -16.088 |
| 2895.1530000000002 | -19.77 |
| 2895.6420000000003 | -22.888 |
| 2896.13 | -24.004 |
| 2896.619 | -25.682 |
| 2897.107 | -28.545 |
| 2897.5959999999995 | -32.095 |
| 2898.084 | -32.768 |
| 2898.5730000000003 | -31.565 |
| 2899.0609999999997 | -30.985 |
| 2899.5499999999997 | -32.091 |
| 2900.038 | -32.758 |
| 2900.527 | -33.112 |
| 2901.015 | -33.088 |
| 2901.504 | -30.689 |
| 2901.992 | -29.412 |
| 2902.481 | -28.635 |
| 2902.969 | -27.793 |
| 2903.458 | -27.075 |
| 2903.9460000000004 | -26.043 |
| 2904.4349999999995 | -23.509 |
| 2904.923 | -21.036 |
| 2905.4120000000003 | -17.937 |
| 2905.8999999999996 | -15.461 |
| 2906.3889999999997 | -12.984 |
| 2906.877 | -9.38 |
| 2907.366 | -4.65 |
| 2907.854 | -1.794 |
| 2908.343 | -1.06 |
| 2908.831 | -1.013 |
| 2909.32 | -0.902 |
| 2909.808 | 0.586 |
| 2910.297 | 1.637 |
| 2910.7850000000003 | 1.19 |
| 2911.2740000000003 | 0.557 |
| 2911.7619999999997 | 0.364 |
| 2912.251 | -0.891 |
| 2912.7390000000005 | -2.52 |
| 2913.2279999999996 | -4.459 |
| 2913.7169999999996 | -6.397 |
| 2914.205 | -6.771 |
| 2914.694 | -7.58 |
| 2915.182 | -8.264 |
| 2915.671 | -9.696 |
| 2916.159 | -12.501 |
| 2916.648 | -13.805 |
| 2917.136 | -14.67 |
| 2917.625 | -14.908 |
| 2918.1130000000003 | -15.832 |
| 2918.6020000000003 | -17.255 |
| 2919.09 | -19.176 |
| 2919.5789999999997 | -21.221 |
| 2920.067 | -22.139 |
| 2920.5560000000005 | -21.181 |
| 2921.044 | -20.096 |
| 2921.533 | -19.885 |
| 2922.0209999999997 | -20.235 |
| 2922.5099999999998 | -20.146 |
| 2922.998 | -19.867 |
| 2923.487 | -19.275 |
| 2923.975 | -19.119 |
| 2924.464 | -20.398 |
| 2924.952 | -21.177 |
| 2925.4410000000003 | -21.766 |
| 2925.929 | -21.916 |
| 2926.4179999999997 | -21.689 |
| 2926.906 | -21.649 |
| 2927.3950000000004 | -20.982 |
| 2927.883 | -20.314 |
| 2928.372 | -20.456 |
| 2928.86 | -20.597 |
| 2929.349 | -19.987 |
| 2929.837 | -20.437 |
| 2930.326 | -22.449 |
| 2930.814 | -24.959 |
| 2931.303 | -25.78 |
| 2931.791 | -26.412 |
| 2932.28 | -27.354 |
| 2932.768 | -27.546 |
| 2933.2569999999996 | -26.173 |
| 2933.746 | -24.174 |
| 2934.2340000000004 | -22.923 |
| 2934.723 | -21.796 |
| 2935.211 | -21.23 |
| 2935.7 | -21.1 |
| 2936.188 | -20.968 |
| 2936.677 | -20.522 |
| 2937.165 | -19.887 |
| 2937.654 | -19.188 |
| 2938.1420000000003 | -19.425 |
| 2938.631 | -19.099 |
| 2939.119 | -18.208 |
| 2939.608 | -16.065 |
| 2940.0959999999995 | -13.984 |
| 2940.585 | -13.651 |
| 2941.0730000000003 | -12.878 |
| 2941.562 | -10.605 |
| 2942.0499999999997 | -6.58 |
| 2942.5389999999998 | -3.616 |
| 2943.027 | -3.587 |
| 2943.516 | -3.808 |
| 2944.004 | -2.714 |
| 2944.493 | -0.494 |
| 2944.981 | -1.397 |
| 2945.4700000000003 | -3.924 |
| 2945.958 | -7.636 |
| 2946.447 | -11.035 |
| 2946.9349999999995 | -13.994 |
| 2947.424 | -16.952 |
| 2947.9120000000003 | -20.034 |
| 2948.401 | -22.364 |
| 2948.8889999999997 | -24.755 |
| 2949.3779999999997 | -26.769 |
| 2949.866 | -27.97 |
| 2950.355 | -28.856 |
| 2950.843 | -29.678 |
| 2951.332 | -30.436 |
| 2951.82 | -31.506 |
| 2952.309 | -32.261 |
| 2952.7980000000002 | -32.327 |
| 2953.286 | -32.266 |
| 2953.775 | -33.204 |
| 2954.2630000000004 | -34.703 |
| 2954.7519999999995 | -37.138 |
| 2955.24 | -39.259 |
| 2955.7290000000003 | -39.504 |
| 2956.2169999999996 | -37.434 |
| 2956.7059999999997 | -36.425 |
| 2957.194 | -37.728 |
| 2957.683 | -37.466 |
| 2958.171 | -36.327 |
| 2958.66 | -34.25 |
| 2959.148 | -33.234 |
| 2959.637 | -33.528 |
| 2960.125 | -33.259 |
| 2960.614 | -32.3 |
| 2961.1020000000003 | -31.715 |
| 2961.5910000000003 | -30.253 |
| 2962.0789999999997 | -29.228 |
| 2962.568 | -29.95 |
| 2963.0560000000005 | -29.297 |
| 2963.5449999999996 | -29.016 |
| 2964.033 | -30.172 |
| 2964.522 | -31.451 |
| 2965.0099999999998 | -33.228 |
| 2965.499 | -36.254 |
| 2965.987 | -37.841 |
| 2966.476 | -38.614 |
| 2966.964 | -38.823 |
| 2967.453 | -39.03 |
| 2967.9410000000003 | -39.111 |
| 2968.4300000000003 | -39.503 |
| 2968.9179999999997 | -40.393 |
| 2969.407 | -39.781 |
| 2969.8950000000004 | -40.668 |
| 2970.384 | -41.991 |
| 2970.872 | -42.438 |
| 2971.361 | -41.633 |
| 2971.849 | -39.576 |
| 2972.3379999999997 | -37.643 |
| 2972.8269999999998 | -37.645 |
| 2973.315 | -36.459 |
| 2973.804 | -34.021 |
| 2974.292 | -31.144 |
| 2974.781 | -30.203 |
| 2975.2690000000002 | -29.136 |
| 2975.7580000000003 | -26.379 |
| 2976.246 | -24.308 |
| 2976.7349999999997 | -23.549 |
| 2977.223 | -24.037 |
| 2977.7120000000004 | -25.9 |
| 2978.2 | -27.948 |
| 2978.689 | -28.994 |
| 2979.177 | -29.789 |
| 2979.666 | -32.145 |
| 2980.154 | -33.187 |
| 2980.643 | -33.665 |
| 2981.131 | -34.828 |
| 2981.62 | -35.678 |
| 2982.108 | -36.026 |
| 2982.597 | -35.685 |
| 2983.085 | -35.905 |
| 2983.5739999999996 | -35.999 |
| 2984.062 | -35.528 |
| 2984.5510000000004 | -35.619 |
| 2985.0389999999998 | -35.27 |
| 2985.528 | -34.982 |
| 2986.016 | -35.693 |
| 2986.505 | -36.964 |
| 2986.993 | -35.734 |
| 2987.482 | -33.69 |
| 2987.9700000000003 | -33.145 |
| 2988.459 | -33.41 |
| 2988.947 | -34.049 |
| 2989.436 | -35.499 |
| 2989.924 | -34.447 |
| 2990.4129999999996 | -32.518 |
| 2990.901 | -30.151 |
| 2991.3900000000003 | -28.344 |
| 2991.8779999999997 | -26.974 |
| 2992.3669999999997 | -25.539 |
| 2992.8559999999998 | -25.353 |
| 2993.344 | -25.853 |
| 2993.833 | -25.351 |
| 2994.321 | -23.16 |
| 2994.81 | -21.343 |
| 2995.2980000000002 | -21.649 |
| 2995.7870000000003 | -21.578 |
| 2996.275 | -20.693 |
| 2996.764 | -20.057 |
| 2997.2519999999995 | -19.919 |
| 2997.741 | -20.155 |
| 2998.2290000000003 | -21.639 |
| 2998.718 | -22.371 |
| 2999.2059999999997 | -24.04 |
| 2999.6949999999997 | -24.957 |
| 3000.183 | -26.497 |
| 3000.672 | -28.161 |
| 3001.16 | -30.198 |
| 3001.649 | -32.171 |
| 3002.137 | -35.455 |
| 3002.626 | -38.363 |
| 3003.114 | -39.706 |
| 3003.603 | -39.735 |
| 3004.0910000000003 | -39.326 |
| 3004.5800000000004 | -38.727 |
| 3005.068 | -38.439 |
| 3005.557 | -38.775 |
| 3006.0449999999996 | -38.921 |
| 3006.5339999999997 | -38.191 |
| 3007.022 | -39.397 |
| 3007.511 | -40.851 |
| 3007.999 | -40.491 |
| 3008.488 | -39.818 |
| 3008.976 | -39.892 |
| 3009.465 | -39.778 |
| 3009.953 | -39.849 |
| 3010.442 | -41.107 |
| 3010.9300000000003 | -41.987 |
| 3011.4190000000003 | -42.304 |
| 3011.907 | -41.994 |
| 3012.3959999999997 | -40.746 |
| 3012.885 | -39.37 |
| 3013.3730000000005 | -38.431 |
| 3013.8619999999996 | -37.427 |
| 3014.35 | -36.859 |
| 3014.839 | -34.603 |
| 3015.3269999999998 | -34.657 |
| 3015.816 | -36.272 |
| 3016.304 | -37.01 |
| 3016.793 | -37.122 |
| 3017.281 | -36.733 |
| 3017.77 | -36.404 |
| 3018.2580000000003 | -35.887 |
| 3018.7470000000003 | -35.055 |
| 3019.2349999999997 | -33.534 |
| 3019.724 | -32.511 |
| 3020.2120000000004 | -31.987 |
| 3020.701 | -31.274 |
| 3021.189 | -30.247 |
| 3021.678 | -29.344 |
| 3022.166 | -28.688 |
| 3022.6549999999997 | -28.906 |
| 3023.143 | -28.998 |
| 3023.632 | -29.276 |
| 3024.12 | -29.176 |
| 3024.609 | -30.701 |
| 3025.097 | -33.224 |
| 3025.5860000000002 | -34.432 |
| 3026.0739999999996 | -34.077 |
| 3026.563 | -34.72 |
| 3027.0510000000004 | -35.174 |
| 3027.54 | -36.377 |
| 3028.028 | -36.14 |
| 3028.517 | -35.152 |
| 3029.005 | -33.725 |
| 3029.494 | -31.671 |
| 3029.982 | -29.803 |
| 3030.471 | -29.871 |
| 3030.959 | -30.812 |
| 3031.448 | -31.877 |
| 3031.936 | -32.628 |
| 3032.425 | -32.877 |
| 3032.914 | -33.813 |
| 3033.402 | -34.496 |
| 3033.8909999999996 | -35.053 |
| 3034.379 | -35.609 |
| 3034.8680000000004 | -35.975 |
| 3035.3559999999998 | -36.903 |
| 3035.845 | -37.266 |
| 3036.333 | -36.128 |
| 3036.822 | -35.488 |
| 3037.31 | -34.784 |
| 3037.799 | -34.266 |
| 3038.2870000000003 | -32.621 |
| 3038.776 | -30.288 |
| 3039.264 | -27.827 |
| 3039.753 | -25.241 |
| 3040.241 | -21.027 |
| 3040.7299999999996 | -16.125 |
| 3041.218 | -11.096 |
| 3041.7070000000003 | -8.19 |
| 3042.1949999999997 | -5.596 |
| 3042.6839999999997 | -2.375 |
| 3043.172 | 0.098 |
| 3043.661 | 0.322 |
| 3044.149 | -1.202 |
| 3044.638 | -3.537 |
| 3045.126 | -5.995 |
| 3045.6150000000002 | -8.452 |
| 3046.103 | -11.595 |
| 3046.592 | -14.299 |
| 3047.0800000000004 | -18.939 |
| 3047.5689999999995 | -23.514 |
| 3048.057 | -27.338 |
| 3048.5460000000003 | -29.911 |
| 3049.0339999999997 | -32.794 |
| 3049.5229999999997 | -35.864 |
| 3050.011 | -38.369 |
| 3050.5 | -39.935 |
| 3050.988 | -41.813 |
| 3051.477 | -44.001 |
| 3051.966 | -45.625 |
| 3052.454 | -48.06 |
| 3052.943 | -50.431 |
| 3053.431 | -52.925 |
| 3053.92 | -55.168 |
| 3054.4080000000004 | -55.722 |
| 3054.8970000000004 | -55.836 |
| 3055.385 | -57.012 |
| 3055.874 | -58.686 |
| 3056.3619999999996 | -59.734 |
| 3056.8509999999997 | -58.28 |
| 3057.339 | -57.449 |
| 3057.828 | -57.742 |
| 3058.316 | -57.221 |
| 3058.805 | -54.948 |
| 3059.293 | -52.298 |
| 3059.782 | -48.898 |
| 3060.27 | -44.933 |
| 3060.759 | -42.091 |
| 3061.2470000000003 | -39.81 |
| 3061.7360000000003 | -37.966 |
| 3062.224 | -35.495 |
| 3062.7129999999997 | -34.397 |
| 3063.201 | -34.985 |
| 3063.6900000000005 | -34.384 |
| 3064.178 | -32.907 |
| 3064.667 | -30.928 |
| 3065.1549999999997 | -29.26 |
| 3065.644 | -29.84 |
| 3066.132 | -30.106 |
| 3066.621 | -29.496 |
| 3067.109 | -28.572 |
| 3067.598 | -27.271 |
| 3068.0860000000002 | -25.719 |
| 3068.5750000000003 | -24.727 |
| 3069.063 | -24.734 |
| 3069.5519999999997 | -24.74 |
| 3070.04 | -24.556 |
| 3070.5290000000005 | -24.871 |
| 3071.017 | -24.872 |
| 3071.506 | -25.871 |
| 3071.995 | -26.869 |
| 3072.4829999999997 | -27.677 |
| 3072.9719999999998 | -27.234 |
| 3073.46 | -26.602 |
| 3073.949 | -27.531 |
| 3074.437 | -30.334 |
| 3074.926 | -31.385 |
| 3075.414 | -30.747 |
| 3075.9030000000002 | -29.794 |
| 3076.3909999999996 | -30.216 |
| 3076.88 | -30.323 |
| 3077.3680000000004 | -30.116 |
| 3077.857 | -29.345 |
| 3078.345 | -27.323 |
| 3078.834 | -25.924 |
| 3079.322 | -24.461 |
| 3079.811 | -23.558 |
| 3080.299 | -21.217 |
| 3080.788 | -19.125 |
| 3081.276 | -18.343 |
| 3081.765 | -17.81 |
| 3082.253 | -15.587 |
| 3082.742 | -12.426 |
| 3083.2299999999996 | -10.826 |
| 3083.719 | -10.036 |
| 3084.2070000000003 | -9.37 |
| 3084.696 | -9.14 |
| 3085.1839999999997 | -9.596 |
| 3085.673 | -9.425 |
| 3086.161 | -10.441 |
| 3086.65 | -11.955 |
| 3087.138 | -14.467 |
| 3087.627 | -17.665 |
| 3088.1150000000002 | -20.487 |
| 3088.6040000000003 | -23.057 |
| 3089.092 | -24.876 |
| 3089.581 | -27.13 |
| 3090.0689999999995 | -29.633 |
| 3090.558 | -32.01 |
| 3091.0460000000003 | -34.385 |
| 3091.535 | -36.758 |
| 3092.0240000000003 | -38.63 |
| 3092.5119999999997 | -39.563 |
| 3093.0009999999997 | -40.182 |
| 3093.489 | -40.674 |
| 3093.978 | -41.415 |
| 3094.466 | -41.404 |
| 3094.955 | -42.017 |
| 3095.443 | -42.378 |
| 3095.9320000000002 | -43.613 |
| 3096.42 | -45.784 |
| 3096.909 | -47.703 |
| 3097.3970000000004 | -46.683 |
| 3097.8859999999995 | -44.599 |
| 3098.374 | -42.639 |
| 3098.8630000000003 | -41.177 |
| 3099.3509999999997 | -40.651 |
| 3099.8399999999997 | -39.561 |
| 3100.328 | -36.719 |
| 3100.817 | -35.001 |
| 3101.305 | -34.906 |
| 3101.794 | -35.873 |
| 3102.282 | -35.775 |
| 3102.771 | -36.364 |
| 3103.259 | -38.45 |
| 3103.748 | -37.911 |
| 3104.2360000000003 | -35.807 |
| 3104.7250000000004 | -34.139 |
| 3105.2129999999997 | -33.657 |
| 3105.702 | -33.549 |
| 3106.1900000000005 | -32.689 |
| 3106.6789999999996 | -31.828 |
| 3107.167 | -30.715 |
| 3107.656 | -30.476 |
| 3108.144 | -30.298 |
| 3108.633 | -29.93 |
| 3109.121 | -29.062 |
| 3109.61 | -27.879 |
| 3110.098 | -27.257 |
| 3110.587 | -26.508 |
| 3111.0750000000003 | -24.196 |
| 3111.5640000000003 | -23.132 |
| 3112.0530000000003 | -22.942 |
| 3112.541 | -23.812 |
| 3113.0299999999997 | -23.181 |
| 3113.518 | -21.049 |
| 3114.0069999999996 | -21.29 |
| 3114.495 | -22.217 |
| 3114.984 | -22.393 |
| 3115.4719999999998 | -23.379 |
| 3115.961 | -24.364 |
| 3116.449 | -24.66 |
| 3116.938 | -24.392 |
| 3117.426 | -23.936 |
| 3117.915 | -24.165 |
| 3118.4030000000002 | -25.205 |
| 3118.8920000000003 | -25.118 |
| 3119.38 | -25.78 |
| 3119.8689999999997 | -25.691 |
| 3120.357 | -25.538 |
| 3120.8460000000005 | -25.633 |
| 3121.334 | -26.976 |
| 3121.823 | -28.443 |
| 3122.311 | -28.284 |
| 3122.7999999999997 | -26.498 |
| 3123.288 | -25.086 |
| 3123.777 | -25.109 |
| 3124.265 | -26.882 |
| 3124.754 | -27.527 |
| 3125.242 | -26.109 |
| 3125.731 | -26.252 |
| 3126.219 | -29.581 |
| 3126.7079999999996 | -33.033 |
| 3127.196 | -34.296 |
| 3127.6850000000004 | -32.808 |
| 3128.173 | -31.568 |
| 3128.662 | -31.077 |
| 3129.15 | -31.084 |
| 3129.639 | -31.34 |
| 3130.127 | -31.845 |
| 3130.616 | -31.785 |
| 3131.105 | -31.912 |
| 3131.593 | -31.474 |
| 3132.082 | -30.91 |
| 3132.57 | -32.282 |
| 3133.059 | -33.715 |
| 3133.5469999999996 | -33.397 |
| 3134.036 | -33.077 |
| 3134.5240000000003 | -32.256 |
| 3135.013 | -31.683 |
| 3135.5009999999997 | -33.733 |
| 3135.99 | -35.72 |
| 3136.478 | -37.393 |
| 3136.967 | -40.002 |
| 3137.455 | -42.422 |
| 3137.944 | -44.09 |
| 3138.4320000000002 | -45.695 |
| 3138.9210000000003 | -47.485 |
| 3139.409 | -48.399 |
| 3139.898 | -47.562 |
| 3140.3859999999995 | -46.223 |
| 3140.875 | -44.32 |
| 3141.3630000000003 | -42.978 |
| 3141.852 | -43.447 |
| 3142.3399999999997 | -44.103 |
| 3142.8289999999997 | -43.757 |
| 3143.317 | -41.722 |
| 3143.806 | -39.185 |
| 3144.294 | -38.96 |
| 3144.783 | -40.858 |
| 3145.271 | -44.379 |
| 3145.76 | -47.399 |
| 3146.248 | -48.231 |
| 3146.737 | -48.123 |
| 3147.2250000000004 | -48.514 |
| 3147.7140000000004 | -49.278 |
| 3148.202 | -50.416 |
| 3148.691 | -50.553 |
| 3149.1789999999996 | -49.875 |
| 3149.6679999999997 | -48.634 |
| 3150.156 | -47.641 |
| 3150.645 | -47.272 |
| 3151.134 | -47.589 |
| 3151.622 | -46.967 |
| 3152.111 | -44.718 |
| 3152.599 | -42.406 |
| 3153.088 | -40.842 |
| 3153.576 | -39.214 |
| 3154.065 | -37.335 |
| 3154.5530000000003 | -36.329 |
| 3155.0420000000004 | -35.197 |
| 3155.5299999999997 | -34.751 |
| 3156.0190000000002 | -33.929 |
| 3156.5069999999996 | -33.917 |
| 3156.9959999999996 | -34.217 |
| 3157.484 | -35.266 |
| 3157.973 | -35.937 |
| 3158.461 | -35.483 |
| 3158.95 | -35.465 |
| 3159.438 | -35.882 |
| 3159.927 | -35.736 |
| 3160.415 | -36.088 |
| 3160.904 | -36.064 |
| 3161.3920000000003 | -36.851 |
| 3161.8810000000003 | -37.825 |
| 3162.3689999999997 | -37.609 |
| 3162.858 | -38.142 |
| 3163.3460000000005 | -39.673 |
| 3163.835 | -40.078 |
| 3164.323 | -39.919 |
| 3164.812 | -39.946 |
| 3165.2999999999997 | -40.847 |
| 3165.7889999999998 | -41.559 |
| 3166.277 | -41.582 |
| 3166.766 | -40.416 |
| 3167.254 | -41.812 |
| 3167.743 | -42.893 |
| 3168.231 | -43.91 |
| 3168.7200000000003 | -44.614 |
| 3169.2079999999996 | -44.441 |
| 3169.697 | -45.33 |
| 3170.1850000000004 | -45.716 |
| 3170.674 | -46.727 |
| 3171.1630000000005 | -48.049 |
| 3171.651 | -47.994 |
| 3172.14 | -48.875 |
| 3172.628 | -50.193 |
| 3173.1169999999997 | -50.259 |
| 3173.605 | -50.824 |
| 3174.094 | -50.45 |
| 3174.582 | -51.324 |
| 3175.071 | -51.885 |
| 3175.559 | -52.069 |
| 3176.0480000000002 | -53.252 |
| 3176.536 | -53.934 |
| 3177.0249999999996 | -53.676 |
| 3177.513 | -52.168 |
| 3178.0020000000004 | -50.845 |
| 3178.49 | -51.959 |
| 3178.979 | -54.008 |
| 3179.467 | -54.682 |
| 3179.956 | -54.479 |
| 3180.444 | -53.962 |
| 3180.933 | -53.256 |
| 3181.4210000000003 | -53.487 |
| 3181.91 | -54.091 |
| 3182.398 | -53.944 |
| 3182.887 | -53.045 |
| 3183.375 | -53.27 |
| 3183.8639999999996 | -53.681 |
| 3184.352 | -53.154 |
| 3184.8410000000003 | -52.125 |
| 3185.3289999999997 | -50.72 |
| 3185.8179999999998 | -49.875 |
| 3186.306 | -48.28 |
| 3186.795 | -46.246 |
| 3187.283 | -45.647 |
| 3187.772 | -45.673 |
| 3188.26 | -46.135 |
| 3188.7490000000003 | -47.283 |
| 3189.237 | -47.929 |
| 3189.726 | -49.449 |
| 3190.2140000000004 | -50.156 |
| 3190.7029999999995 | -49.986 |
| 3191.192 | -49.502 |
| 3191.6800000000003 | -50.892 |
| 3192.169 | -53.28 |
| 3192.6569999999997 | -54.793 |
| 3193.1459999999997 | -54.304 |
| 3193.634 | -53.438 |
| 3194.123 | -52.884 |
| 3194.611 | -52.016 |
| 3195.1 | -50.147 |
| 3195.588 | -47.464 |
| 3196.077 | -44.779 |
| 3196.565 | -41.969 |
| 3197.054 | -39.782 |
| 3197.5420000000004 | -38.531 |
| 3198.031 | -38.091 |
| 3198.5190000000002 | -36.15 |
| 3199.008 | -36.083 |
| 3199.4959999999996 | -37.14 |
| 3199.9849999999997 | -38.507 |
| 3200.473 | -39.124 |
| 3200.962 | -40.739 |
| 3201.45 | -42.54 |
| 3201.939 | -45.153 |
| 3202.427 | -47.389 |
| 3202.916 | -48.937 |
| 3203.404 | -50.233 |
| 3203.893 | -51.34 |
| 3204.3810000000003 | -52.509 |
| 3204.8700000000003 | -53.551 |
| 3205.358 | -54.342 |
| 3205.8469999999998 | -54.632 |
| 3206.335 | -55.171 |
| 3206.8239999999996 | -55.708 |
| 3207.312 | -56.682 |
| 3207.801 | -57.591 |
| 3208.2889999999998 | -58.187 |
| 3208.778 | -58.344 |
| 3209.266 | -58.5 |
| 3209.755 | -59.343 |
| 3210.243 | -60.621 |
| 3210.732 | -62.461 |
| 3211.221 | -63.112 |
| 3211.7090000000003 | -61.699 |
| 3212.1980000000003 | -59.472 |
| 3212.6859999999997 | -57.307 |
| 3213.175 | -55.953 |
| 3213.6630000000005 | -54.41 |
| 3214.152 | -52.241 |
| 3214.64 | -51.508 |
| 3215.129 | -51.774 |
| 3215.6169999999997 | -52.477 |
| 3216.1059999999998 | -51.803 |
| 3216.594 | -51.127 |
| 3217.083 | -50.639 |
| 3217.571 | -50.898 |
| 3218.06 | -51.657 |
| 3218.5480000000002 | -52.227 |
| 3219.0370000000003 | -53.358 |
| 3219.5249999999996 | -53.05 |
| 3220.014 | -51.867 |
| 3220.5020000000004 | -51.057 |
| 3220.991 | -50.62 |
| 3221.479 | -50.558 |
| 3221.968 | -50.744 |
| 3222.456 | -48.742 |
| 3222.945 | -46.551 |
| 3223.433 | -46.108 |
| 3223.922 | -47.04 |
| 3224.41 | -45.845 |
| 3224.899 | -45.462 |
| 3225.387 | -47.64 |
| 3225.876 | -49.754 |
| 3226.3639999999996 | -49.742 |
| 3226.853 | -48.729 |
| 3227.3410000000003 | -48.464 |
| 3227.83 | -48.261 |
| 3228.3179999999998 | -48.87 |
| 3228.807 | -48.414 |
| 3229.295 | -47.333 |
| 3229.784 | -46.5 |
| 3230.273 | -45.791 |
| 3230.761 | -44.643 |
| 3231.25 | -45.307 |
| 3231.7380000000003 | -46.282 |
| 3232.227 | -46.381 |
| 3232.715 | -45.478 |
| 3233.204 | -44.887 |
| 3233.692 | -43.17 |
| 3234.1809999999996 | -42.264 |
| 3234.669 | -42.295 |
| 3235.1580000000004 | -43.324 |
| 3235.6459999999997 | -44.665 |
| 3236.1349999999998 | -46.442 |
| 3236.623 | -47.218 |
| 3237.112 | -47.805 |
| 3237.6 | -47.204 |
| 3238.089 | -47.351 |
| 3238.577 | -47.123 |
| 3239.0660000000003 | -46.205 |
| 3239.554 | -44.662 |
| 3240.043 | -43.18 |
| 3240.531 | -42.196 |
| 3241.0199999999995 | -41.962 |
| 3241.508 | -40.977 |
| 3241.9970000000003 | -40.24 |
| 3242.4849999999997 | -40.002 |
| 3242.9739999999997 | -39.076 |
| 3243.462 | -37.711 |
| 3243.951 | -36.345 |
| 3244.439 | -34.977 |
| 3244.928 | -34.296 |
| 3245.416 | -33.802 |
| 3245.905 | -32.744 |
| 3246.393 | -30.997 |
| 3246.882 | -29.749 |
| 3247.3700000000003 | -28.5 |
| 3247.8590000000004 | -26.813 |
| 3248.3469999999998 | -25.874 |
| 3248.8360000000002 | -24.622 |
| 3249.3239999999996 | -23.556 |
| 3249.8129999999996 | -22.864 |
| 3250.3019999999997 | -24.421 |
| 3250.79 | -25.977 |
| 3251.279 | -27.97 |
| 3251.767 | -30.399 |
| 3252.256 | -32.576 |
| 3252.744 | -32.69 |
| 3253.233 | -32.616 |
| 3253.721 | -33.79 |
| 3254.21 | -35.464 |
| 3254.6980000000003 | -35.448 |
| 3255.1870000000004 | -34.62 |
| 3255.675 | -32.665 |
| 3256.1639999999998 | -31.084 |
| 3256.652 | -30.064 |
| 3257.1409999999996 | -30.356 |
| 3257.629 | -29.335 |
| 3258.118 | -26.125 |
| 3258.6059999999998 | -21.414 |
| 3259.095 | -18.014 |
| 3259.583 | -15.363 |
| 3260.072 | -12.461 |
| 3260.56 | -8.683 |
| 3261.049 | -5.654 |
| 3261.5370000000003 | -3.874 |
| 3262.0260000000003 | -2.718 |
| 3262.514 | -0.686 |
| 3263.0029999999997 | 2.284 |
| 3263.491 | 4.568 |
| 3263.9800000000005 | 5.291 |
| 3264.468 | 6.827 |
| 3264.957 | 8.552 |
| 3265.445 | 8.652 |
| 3265.9339999999997 | 8.129 |
| 3266.422 | 10.107 |
| 3266.911 | 13.085 |
| 3267.399 | 14.315 |
| 3267.888 | 13.983 |
| 3268.376 | 13.965 |
| 3268.8650000000002 | 14.01 |
| 3269.353 | 13.931 |
| 3269.8419999999996 | 13.103 |
| 3270.331 | 10.027 |
| 3270.8190000000004 | 6.263 |
| 3271.308 | 2.314 |
| 3271.796 | -2.823 |
| 3272.285 | -7.021 |
| 3272.773 | -9.905 |
| 3273.2619999999997 | -12.788 |
| 3273.75 | -15.046 |
| 3274.239 | -16.802 |
| 3274.727 | -15.995 |
| 3275.216 | -15.75 |
| 3275.704 | -14.316 |
| 3276.193 | -12.881 |
| 3276.6809999999996 | -10.757 |
| 3277.17 | -7.758 |
| 3277.6580000000004 | -5.32 |
| 3278.147 | -3.819 |
| 3278.6349999999998 | -2.817 |
| 3279.124 | -1.751 |
| 3279.612 | -1.685 |
| 3280.101 | -2.18 |
| 3280.589 | -1.299 |
| 3281.078 | 0.083 |
| 3281.5660000000003 | 1.841 |
| 3282.055 | 4.162 |
| 3282.543 | 6.735 |
| 3283.032 | 8.933 |
| 3283.5199999999995 | 11.757 |
| 3284.009 | 14.582 |
| 3284.4970000000003 | 16.845 |
| 3284.986 | 18.734 |
| 3285.4739999999997 | 20.75 |
| 3285.9629999999997 | 21.328 |
| 3286.451 | 21.72 |
| 3286.94 | 22.613 |
| 3287.428 | 22.257 |
| 3287.917 | 19.777 |
| 3288.405 | 18.923 |
| 3288.8940000000002 | 19.444 |
| 3289.382 | 19.966 |
| 3289.871 | 19.365 |
| 3290.36 | 18.139 |
| 3290.848 | 18.852 |
| 3291.3369999999995 | 20.065 |
| 3291.825 | 20.654 |
| 3292.3140000000003 | 20.932 |
| 3292.8019999999997 | 21.773 |
| 3293.2909999999997 | 21.803 |
| 3293.779 | 22.27 |
| 3294.268 | 22.864 |
| 3294.756 | 23.334 |
| 3295.245 | 24.242 |
| 3295.733 | 24.713 |
| 3296.222 | 24.122 |
| 3296.71 | 21.908 |
| 3297.199 | 18.819 |
| 3297.6870000000004 | 15.544 |
| 3298.1760000000004 | 12.707 |
| 3298.6639999999998 | 10.683 |
| 3299.1530000000002 | 9.348 |
| 3299.6409999999996 | 6.763 |
| 3300.1299999999997 | 2.492 |
| 3300.618 | -1.466 |
| 3301.107 | -3.36 |
| 3301.595 | -5.691 |
| 3302.084 | -9.334 |
| 3302.572 | -12.039 |
| 3303.061 | -12.68 |
| 3303.549 | -12.258 |
| 3304.038 | -12.523 |
| 3304.5260000000003 | -12.724 |
| 3305.0150000000003 | -12.55 |
| 3305.5029999999997 | -12.437 |
| 3305.992 | -12.011 |
| 3306.4800000000005 | -10.084 |
| 3306.969 | -8.156 |
| 3307.457 | -7.228 |
| 3307.946 | -6.236 |
| 3308.4339999999997 | -3.806 |
| 3308.923 | -0.438 |
| 3309.412 | 1.556 |
| 3309.9 | 1.863 |
| 3310.389 | 1.484 |
| 3310.877 | 1.293 |
| 3311.366 | 1.227 |
| 3311.8540000000003 | 1.975 |
| 3312.3430000000003 | 1.849 |
| 3312.831 | 2.161 |
| 3313.3199999999997 | 2.161 |
| 3313.808 | 0.974 |
| 3314.2970000000005 | 0.351 |
| 3314.785 | 0.416 |
| 3315.274 | 0.419 |
| 3315.7619999999997 | 0.735 |
| 3316.2509999999997 | 1.052 |
| 3316.739 | 1.682 |
| 3317.228 | 2.063 |
| 3317.716 | 1.445 |
| 3318.205 | 1.452 |
| 3318.693 | -0.164 |
| 3319.1820000000002 | -0.781 |
| 3319.67 | -0.334 |
| 3320.1589999999997 | 0.614 |
| 3320.647 | 0.25 |
| 3321.1360000000004 | -0.238 |
| 3321.624 | 0.712 |
| 3322.113 | 2.225 |
| 3322.601 | 2.676 |
| 3323.09 | 2.191 |
| 3323.578 | 2.518 |
| 3324.067 | 3.784 |
| 3324.555 | 4.551 |
| 3325.044 | 3.443 |
| 3325.532 | 2.773 |
| 3326.021 | 3.167 |
| 3326.509 | 5.561 |
| 3326.9979999999996 | 8.018 |
| 3327.486 | 10.976 |
| 3327.9750000000004 | 13.56 |
| 3328.4629999999997 | 15.269 |
| 3328.9519999999998 | 18.479 |
| 3329.441 | 22.502 |
| 3329.929 | 25.901 |
| 3330.418 | 28.175 |
| 3330.906 | 31.263 |
| 3331.395 | 34.288 |
| 3331.8830000000003 | 35.815 |
| 3332.372 | 37.029 |
| 3332.86 | 39.369 |
| 3333.349 | 40.772 |
| 3333.8369999999995 | 39.176 |
| 3334.326 | 37.518 |
| 3334.8140000000003 | 36.548 |
| 3335.303 | 35.828 |
| 3335.7909999999997 | 33.922 |
| 3336.2799999999997 | 31.204 |
| 3336.768 | 27.486 |
| 3337.257 | 23.394 |
| 3337.745 | 20.99 |
| 3338.234 | 19.649 |
| 3338.722 | 18.184 |
| 3339.2110000000002 | 16.095 |
| 3339.699 | 14.005 |
| 3340.188 | 12.229 |
| 3340.6760000000004 | 10.391 |
| 3341.165 | 8.242 |
| 3341.6530000000002 | 6.092 |
| 3342.142 | 3.631 |
| 3342.6299999999997 | 1.92 |
| 3343.1189999999997 | 0.148 |
| 3343.607 | -0.624 |
| 3344.096 | -1.084 |
| 3344.584 | -1.48 |
| 3345.073 | -0.875 |
| 3345.561 | -0.895 |
| 3346.05 | -1.352 |
| 3346.538 | 0.254 |
| 3347.027 | 2.111 |
| 3347.5150000000003 | 3.655 |
| 3348.0040000000004 | 6.263 |
| 3348.492 | 9.246 |
| 3348.9809999999998 | 12.293 |
| 3349.4700000000003 | 13.964 |
| 3349.9579999999996 | 15.699 |
| 3350.4469999999997 | 16.309 |
| 3350.935 | 15.045 |
| 3351.424 | 15.781 |
| 3351.912 | 17.268 |
| 3352.401 | 17.63 |
| 3352.889 | 15.805 |
| 3353.378 | 14.293 |
| 3353.866 | 14.094 |
| 3354.355 | 15.271 |
| 3354.8430000000003 | 15.948 |
| 3355.3320000000003 | 16.438 |
| 3355.8199999999997 | 17.741 |
| 3356.309 | 17.107 |
| 3356.7970000000005 | 17.723 |
| 3357.2859999999996 | 19.215 |
| 3357.774 | 20.02 |
| 3358.263 | 19.388 |
| 3358.7509999999997 | 17.756 |
| 3359.24 | 16.625 |
| 3359.728 | 16.494 |
| 3360.217 | 16.676 |
| 3360.705 | 16.671 |
| 3361.194 | 15.853 |
| 3361.6820000000002 | 15.662 |
| 3362.1710000000003 | 15.908 |
| 3362.6589999999997 | 16.654 |
| 3363.148 | 15.339 |
| 3363.6360000000004 | 13.774 |
| 3364.125 | 13.209 |
| 3364.613 | 14.207 |
| 3365.102 | 14.143 |
| 3365.59 | 14.08 |
| 3366.0789999999997 | 12.892 |
| 3366.567 | 12.766 |
| 3367.056 | 15.641 |
| 3367.544 | 17.079 |
| 3368.033 | 17.143 |
| 3368.521 | 16.519 |
| 3369.01 | 17.271 |
| 3369.4990000000003 | 17.398 |
| 3369.987 | 14.4 |
| 3370.4759999999997 | 12.59 |
| 3370.964 | 13.281 |
| 3371.4530000000004 | 14.846 |
| 3371.941 | 18.163 |
| 3372.43 | 20.542 |
| 3372.918 | 20.296 |
| 3373.407 | 18.176 |
| 3373.895 | 17.743 |
| 3374.384 | 18.436 |
| 3374.872 | 19.067 |
| 3375.361 | 18.448 |
| 3375.849 | 16.079 |
| 3376.338 | 13.96 |
| 3376.826 | 12.405 |
| 3377.3149999999996 | 11.662 |
| 3377.803 | 10.732 |
| 3378.2920000000004 | 8.802 |
| 3378.7799999999997 | 6.373 |
| 3379.269 | 5.193 |
| 3379.757 | 5.577 |
| 3380.246 | 6.086 |
| 3380.734 | 7.22 |
| 3381.223 | 8.542 |
| 3381.7110000000002 | 9.989 |
| 3382.2000000000003 | 10.749 |
| 3382.688 | 11.322 |
| 3383.177 | 12.27 |
| 3383.665 | 12.593 |
| 3384.1539999999995 | 13.792 |
| 3384.642 | 17.553 |
| 3385.1310000000003 | 21.877 |
| 3385.6189999999997 | 24.576 |
| 3386.1079999999997 | 26.838 |
| 3386.596 | 30.662 |
| 3387.085 | 35.175 |
| 3387.573 | 40.312 |
| 3388.062 | 45.012 |
| 3388.55 | 47.838 |
| 3389.039 | 49.289 |
| 3389.5280000000002 | 51.052 |
| 3390.016 | 52.316 |
| 3390.505 | 51.954 |
| 3390.9930000000004 | 51.843 |
| 3391.482 | 50.607 |
| 3391.9700000000003 | 48.247 |
| 3392.459 | 46.011 |
| 3392.9469999999997 | 43.651 |
| 3393.4359999999997 | 40.916 |
| 3393.924 | 38.743 |
| 3394.413 | 36.008 |
| 3394.901 | 32.586 |
| 3395.39 | 30.227 |
| 3395.878 | 29.242 |
| 3396.367 | 28.945 |
| 3396.855 | 29.086 |
| 3397.344 | 28.352 |
| 3397.8320000000003 | 25.806 |
| 3398.3210000000004 | 22.572 |
| 3398.809 | 20.401 |
| 3399.298 | 19.605 |
| 3399.7859999999996 | 19.747 |
| 3400.2749999999996 | 20.326 |
| 3400.763 | 21.843 |
| 3401.252 | 24.61 |
| 3401.74 | 27.627 |
| 3402.229 | 30.082 |
| 3402.717 | 32.286 |
| 3403.206 | 33.304 |
| 3403.694 | 33.821 |
| 3404.183 | 33.776 |
| 3404.6710000000003 | 32.856 |
| 3405.1600000000003 | 31.624 |
| 3405.648 | 31.142 |
| 3406.1369999999997 | 30.722 |
| 3406.625 | 30.927 |
| 3407.1140000000005 | 31.945 |
| 3407.602 | 32.838 |
| 3408.091 | 32.918 |
| 3408.58 | 33.436 |
| 3409.0679999999998 | 32.892 |
| 3409.557 | 31.41 |
| 3410.045 | 30.866 |
| 3410.534 | 31.009 |
| 3411.022 | 32.339 |
| 3411.511 | 32.545 |
| 3411.9990000000003 | 32.563 |
| 3412.4880000000003 | 32.956 |
| 3412.9759999999997 | 35.225 |
| 3413.465 | 38.618 |
| 3413.9530000000004 | 41.948 |
| 3414.442 | 44.529 |
| 3414.93 | 45.61 |
| 3415.419 | 47.065 |
| 3415.907 | 48.583 |
| 3416.3959999999997 | 49.539 |
| 3416.884 | 49.307 |
| 3417.373 | 48.388 |
| 3417.861 | 46.905 |
| 3418.35 | 46.111 |
| 3418.838 | 45.066 |
| 3419.327 | 44.396 |
| 3419.8149999999996 | 44.039 |
| 3420.304 | 44.619 |
| 3420.7920000000004 | 46.012 |
| 3421.281 | 48.03 |
| 3421.769 | 49.36 |
| 3422.258 | 51.939 |
| 3422.746 | 55.769 |
| 3423.235 | 58.474 |
| 3423.723 | 59.928 |
| 3424.212 | 59.945 |
| 3424.7000000000003 | 60.587 |
| 3425.189 | 59.854 |
| 3425.677 | 57.996 |
| 3426.166 | 56.137 |
| 3426.6539999999995 | 54.904 |
| 3427.143 | 53.108 |
| 3427.6310000000003 | 50.749 |
| 3428.12 | 47.265 |
| 3428.6090000000004 | 44.468 |
| 3429.0969999999998 | 42.547 |
| 3429.586 | 40.75 |
| 3430.074 | 39.39 |
| 3430.563 | 37.468 |
| 3431.051 | 34.733 |
| 3431.54 | 32.123 |
| 3432.0280000000002 | 32.388 |
| 3432.5170000000003 | 32.965 |
| 3433.005 | 32.542 |
| 3433.494 | 32.619 |
| 3433.982 | 34.07 |
| 3434.4709999999995 | 34.084 |
| 3434.959 | 33.411 |
| 3435.4480000000003 | 33.612 |
| 3435.9359999999997 | 34.437 |
| 3436.4249999999997 | 35.263 |
| 3436.913 | 37.213 |
| 3437.402 | 39.663 |
| 3437.89 | 42.176 |
| 3438.379 | 44.001 |
| 3438.867 | 47.2 |
| 3439.356 | 50.837 |
| 3439.844 | 54.036 |
| 3440.333 | 56.547 |
| 3440.8210000000004 | 57.12 |
| 3441.3099999999995 | 56.381 |
| 3441.798 | 54.892 |
| 3442.2870000000003 | 53.214 |
| 3442.7749999999996 | 52.537 |
| 3443.2639999999997 | 52.359 |
| 3443.752 | 53.118 |
| 3444.241 | 54.002 |
| 3444.729 | 53.324 |
| 3445.218 | 52.082 |
| 3445.706 | 51.278 |
| 3446.195 | 51.411 |
| 3446.683 | 51.481 |
| 3447.172 | 50.613 |
| 3447.6600000000003 | 50.057 |
| 3448.1490000000003 | 51.501 |
| 3448.6380000000004 | 53.57 |
| 3449.126 | 55.826 |
| 3449.615 | 57.644 |
| 3450.1029999999996 | 59.775 |
| 3450.5919999999996 | 62.092 |
| 3451.08 | 64.097 |
| 3451.569 | 66.038 |
| 3452.057 | 67.917 |
| 3452.546 | 68.796 |
| 3453.034 | 68.549 |
| 3453.523 | 67.301 |
| 3454.011 | 66.866 |
| 3454.5 | 68.181 |
| 3454.9880000000003 | 70.12 |
| 3455.4770000000003 | 71.309 |
| 3455.965 | 73.559 |
| 3456.4539999999997 | 74.372 |
| 3456.942 | 74.747 |
| 3457.4310000000005 | 74.247 |
| 3457.919 | 74.059 |
| 3458.408 | 74.495 |
| 3458.8959999999997 | 73.743 |
| 3459.3849999999998 | 71.178 |
| 3459.873 | 68.801 |
| 3460.362 | 65.985 |
| 3460.85 | 63.794 |
| 3461.339 | 63.54 |
| 3461.827 | 63.161 |
| 3462.3160000000003 | 61.406 |
| 3462.804 | 58.651 |
| 3463.2929999999997 | 56.708 |
| 3463.781 | 55.514 |
| 3464.2700000000004 | 55.32 |
| 3464.758 | 55.125 |
| 3465.247 | 54.68 |
| 3465.735 | 55.672 |
| 3466.224 | 58.788 |
| 3466.712 | 62.279 |
| 3467.201 | 65.769 |
| 3467.689 | 67.696 |
| 3468.178 | 68.998 |
| 3468.667 | 70.549 |
| 3469.155 | 70.662 |
| 3469.6440000000002 | 70.462 |
| 3470.1319999999996 | 70.45 |
| 3470.621 | 68.999 |
| 3471.1090000000004 | 67.547 |
| 3471.598 | 66.47 |
| 3472.086 | 65.33 |
| 3472.575 | 64.439 |
| 3473.063 | 64.673 |
| 3473.552 | 64.969 |
| 3474.04 | 64.826 |
| 3474.529 | 64.246 |
| 3475.0170000000003 | 63.79 |
| 3475.506 | 64.27 |
| 3475.994 | 65.501 |
| 3476.483 | 68.418 |
| 3476.9709999999995 | 71.584 |
| 3477.46 | 74.063 |
| 3477.9480000000003 | 76.853 |
| 3478.437 | 80.267 |
| 3478.9249999999997 | 83.494 |
| 3479.4139999999998 | 86.22 |
| 3479.902 | 87.133 |
| 3480.391 | 86.92 |
| 3480.879 | 88.019 |
| 3481.368 | 88.054 |
| 3481.856 | 86.652 |
| 3482.3450000000003 | 84.811 |
| 3482.833 | 83.47 |
| 3483.322 | 83.253 |
| 3483.8099999999995 | 81.723 |
| 3484.299 | 79.63 |
| 3484.7870000000003 | 77.848 |
| 3485.276 | 76.441 |
| 3485.7639999999997 | 74.596 |
| 3486.2529999999997 | 74.999 |
| 3486.741 | 74.903 |
| 3487.23 | 73.43 |
| 3487.719 | 73.832 |
| 3488.207 | 74.983 |
| 3488.696 | 74.508 |
| 3489.184 | 72.158 |
| 3489.6730000000002 | 69.556 |
| 3490.161 | 68.829 |
| 3490.65 | 68.477 |
| 3491.1380000000004 | 69.186 |
| 3491.6269999999995 | 67.457 |
| 3492.115 | 65.351 |
| 3492.6040000000003 | 65.308 |
| 3493.0919999999996 | 64.577 |
| 3493.5809999999997 | 63.469 |
| 3494.069 | 64.424 |
| 3494.558 | 67.127 |
| 3495.046 | 69.33 |
| 3495.535 | 71.719 |
| 3496.023 | 73.92 |
| 3496.512 | 76.558 |
| 3497.0 | 78.383 |
| 3497.489 | 79.081 |
| 3497.9770000000003 | 78.467 |
| 3498.4660000000003 | 78.476 |
| 3498.9539999999997 | 79.172 |
| 3499.443 | 81.368 |
| 3499.9310000000005 | 81.937 |
| 3500.4199999999996 | 82.943 |
| 3500.908 | 82.886 |
| 3501.397 | 82.14 |
| 3501.8849999999998 | 80.894 |
| 3502.374 | 80.771 |
| 3502.862 | 81.835 |
| 3503.351 | 83.148 |
| 3503.839 | 84.523 |
| 3504.328 | 85.585 |
| 3504.8160000000003 | 86.458 |
| 3505.3050000000003 | 88.643 |
| 3505.7929999999997 | 91.764 |
| 3506.282 | 93.759 |
| 3506.7700000000004 | 95.003 |
| 3507.259 | 95.809 |
| 3507.7480000000005 | 96.864 |
| 3508.236 | 97.668 |
| 3508.725 | 96.784 |
| 3509.2129999999997 | 93.961 |
| 3509.7019999999998 | 90.075 |
| 3510.19 | 86.562 |
| 3510.679 | 84.737 |
| 3511.167 | 82.722 |
| 3511.656 | 79.02 |
| 3512.1440000000002 | 75.003 |
| 3512.6330000000003 | 72.111 |
| 3513.121 | 70.843 |
| 3513.6099999999997 | 68.824 |
| 3514.098 | 67.866 |
| 3514.5870000000004 | 67.845 |
| 3515.075 | 67.885 |
| 3515.564 | 66.862 |
| 3516.052 | 64.15 |
| 3516.541 | 62.124 |
| 3517.029 | 62.535 |
| 3517.518 | 65.07 |
| 3518.006 | 65.979 |
| 3518.495 | 64.7 |
| 3518.983 | 63.294 |
| 3519.472 | 62.262 |
| 3519.96 | 61.979 |
| 3520.4489999999996 | 61.571 |
| 3520.937 | 61.223 |
| 3521.4260000000004 | 60.937 |
| 3521.9139999999998 | 60.587 |
| 3522.403 | 59.549 |
| 3522.891 | 58.447 |
| 3523.38 | 58.156 |
| 3523.868 | 58.802 |
| 3524.357 | 60.259 |
| 3524.8450000000003 | 61.653 |
| 3525.334 | 62.608 |
| 3525.822 | 62.999 |
| 3526.311 | 62.952 |
| 3526.799 | 61.591 |
| 3527.2879999999996 | 59.416 |
| 3527.777 | 58.928 |
| 3528.2650000000003 | 58.001 |
| 3528.754 | 56.885 |
| 3529.2419999999997 | 55.893 |
| 3529.7309999999998 | 55.712 |
| 3530.219 | 56.968 |
| 3530.708 | 57.848 |
| 3531.196 | 58.976 |
| 3531.685 | 59.166 |
| 3532.1730000000002 | 59.354 |
| 3532.6620000000003 | 59.479 |
| 3533.15 | 59.852 |
| 3533.639 | 61.162 |
| 3534.1269999999995 | 62.158 |
| 3534.616 | 61.84 |
| 3535.1040000000003 | 61.333 |
| 3535.593 | 61.513 |
| 3536.0809999999997 | 62.629 |
| 3536.5699999999997 | 62.493 |
| 3537.058 | 59.732 |
| 3537.547 | 57.344 |
| 3538.035 | 55.892 |
| 3538.524 | 56.252 |
| 3539.012 | 57.672 |
| 3539.501 | 59.654 |
| 3539.989 | 60.885 |
| 3540.478 | 61.551 |
| 3540.9660000000003 | 62.154 |
| 3541.4550000000004 | 62.756 |
| 3541.943 | 62.981 |
| 3542.432 | 62.768 |
| 3542.9199999999996 | 62.928 |
| 3543.4089999999997 | 63.586 |
| 3543.897 | 63.119 |
| 3544.386 | 63.15 |
| 3544.874 | 63.117 |
| 3545.363 | 64.145 |
| 3545.851 | 67.485 |
| 3546.34 | 70.323 |
| 3546.828 | 73.409 |
| 3547.317 | 75.182 |
| 3547.806 | 76.703 |
| 3548.2940000000003 | 78.036 |
| 3548.7830000000004 | 79.679 |
| 3549.2709999999997 | 80.696 |
| 3549.76 | 80.524 |
| 3550.2480000000005 | 79.851 |
| 3550.7369999999996 | 78.801 |
| 3551.225 | 78.562 |
| 3551.714 | 78.697 |
| 3552.2019999999998 | 78.206 |
| 3552.691 | 76.588 |
| 3553.179 | 77.031 |
| 3553.668 | 79.16 |
| 3554.156 | 80.162 |
| 3554.645 | 80.663 |
| 3555.1330000000003 | 81.038 |
| 3555.6220000000003 | 79.786 |
| 3556.1099999999997 | 80.157 |
| 3556.599 | 80.965 |
| 3557.0870000000004 | 81.521 |
| 3557.576 | 81.325 |
| 3558.064 | 81.128 |
| 3558.553 | 81.992 |
| 3559.041 | 82.792 |
| 3559.5299999999997 | 82.153 |
| 3560.018 | 80.012 |
| 3560.507 | 78.62 |
| 3560.995 | 77.163 |
| 3561.484 | 76.58 |
| 3561.972 | 75.183 |
| 3562.4610000000002 | 73.285 |
| 3562.9489999999996 | 71.635 |
| 3563.438 | 70.358 |
| 3563.9260000000004 | 69.642 |
| 3564.415 | 70.612 |
| 3564.903 | 71.893 |
| 3565.392 | 70.547 |
| 3565.88 | 68.013 |
| 3566.369 | 64.914 |
| 3566.857 | 64.438 |
| 3567.346 | 65.586 |
| 3567.835 | 65.419 |
| 3568.323 | 64.501 |
| 3568.812 | 63.582 |
| 3569.3 | 64.66 |
| 3569.789 | 66.8 |
| 3570.277 | 69.25 |
| 3570.7659999999996 | 70.449 |
| 3571.254 | 71.646 |
| 3571.7430000000004 | 72.653 |
| 3572.2309999999998 | 73.472 |
| 3572.72 | 74.289 |
| 3573.208 | 75.166 |
| 3573.697 | 76.73 |
| 3574.185 | 77.291 |
| 3574.674 | 77.476 |
| 3575.1620000000003 | 77.284 |
| 3575.651 | 76.278 |
| 3576.139 | 76.02 |
| 3576.628 | 77.823 |
| 3577.116 | 78.874 |
| 3577.6049999999996 | 77.549 |
| 3578.093 | 74.409 |
| 3578.5820000000003 | 71.517 |
| 3579.0699999999997 | 68.874 |
| 3579.5589999999997 | 67.853 |
| 3580.047 | 67.581 |
| 3580.536 | 66.745 |
| 3581.024 | 65.719 |
| 3581.513 | 67.629 |
| 3582.001 | 69.537 |
| 3582.4900000000002 | 72.319 |
| 3582.978 | 73.723 |
| 3583.467 | 74.501 |
| 3583.9550000000004 | 74.152 |
| 3584.4439999999995 | 74.176 |
| 3584.932 | 75.448 |
| 3585.4210000000003 | 76.405 |
| 3585.9089999999997 | 76.174 |
| 3586.3979999999997 | 75.753 |
| 3586.8869999999997 | 74.392 |
| 3587.375 | 73.78 |
| 3587.864 | 73.103 |
| 3588.352 | 73.112 |
| 3588.841 | 71.431 |
| 3589.329 | 68.936 |
| 3589.818 | 66.627 |
| 3590.306 | 65.941 |
| 3590.795 | 66.877 |
| 3591.2830000000004 | 69.187 |
| 3591.7720000000004 | 70.308 |
| 3592.26 | 70.551 |
| 3592.749 | 70.98 |
| 3593.2369999999996 | 72.719 |
| 3593.7259999999997 | 74.769 |
| 3594.214 | 76.817 |
| 3594.703 | 78.676 |
| 3595.191 | 79.97 |
| 3595.68 | 81.574 |
| 3596.168 | 83.052 |
| 3596.657 | 83.09 |
| 3597.145 | 83.313 |
| 3597.634 | 83.347 |
| 3598.1220000000003 | 82.254 |
| 3598.6110000000003 | 80.221 |
| 3599.099 | 78.499 |
| 3599.5879999999997 | 78.025 |
| 3600.076 | 77.486 |
| 3600.5650000000005 | 77.57 |
| 3601.053 | 79.215 |
| 3601.542 | 80.732 |
| 3602.0299999999997 | 80.748 |
| 3602.519 | 80.761 |
| 3603.007 | 81.71 |
| 3603.496 | 81.406 |
| 3603.984 | 79.413 |
| 3604.473 | 76.731 |
| 3604.9610000000002 | 74.796 |
| 3605.4500000000003 | 73.047 |
| 3605.938 | 71.233 |
| 3606.4269999999997 | 69.417 |
| 3606.916 | 68.536 |
| 3607.4040000000005 | 69.215 |
| 3607.893 | 71.018 |
| 3608.381 | 71.443 |
| 3608.87 | 70.303 |
| 3609.3579999999997 | 70.537 |
| 3609.8469999999998 | 71.455 |
| 3610.335 | 71.497 |
| 3610.824 | 71.161 |
| 3611.312 | 70.136 |
| 3611.801 | 68.858 |
| 3612.289 | 65.703 |
| 3612.7780000000002 | 61.359 |
| 3613.2659999999996 | 58.824 |
| 3613.755 | 58.351 |
| 3614.2430000000004 | 57.187 |
| 3614.732 | 55.458 |
| 3615.22 | 52.852 |
| 3615.709 | 51.307 |
| 3616.197 | 49.884 |
| 3616.686 | 48.959 |
| 3617.174 | 49.719 |
| 3617.663 | 50.102 |
| 3618.151 | 51.732 |
| 3618.64 | 52.673 |
| 3619.128 | 53.549 |
| 3619.617 | 54.61 |
| 3620.1049999999996 | 57.169 |
| 3620.594 | 60.663 |
| 3621.0820000000003 | 64.029 |
| 3621.571 | 63.456 |
| 3622.0589999999997 | 60.131 |
| 3622.548 | 57.615 |
| 3623.036 | 56.222 |
| 3623.525 | 54.827 |
| 3624.013 | 52.805 |
| 3624.502 | 50.655 |
| 3624.9900000000002 | 48.315 |
| 3625.4790000000003 | 45.473 |
| 3625.967 | 43.378 |
| 3626.456 | 42.781 |
| 3626.945 | 43.181 |
| 3627.433 | 42.142 |
| 3627.9219999999996 | 40.975 |
| 3628.41 | 40.244 |
| 3628.8990000000003 | 42.009 |
| 3629.3869999999997 | 41.898 |
| 3629.8759999999997 | 40.409 |
| 3630.364 | 38.98 |
| 3630.853 | 37.736 |
| 3631.341 | 35.677 |
| 3631.83 | 33.303 |
| 3632.318 | 33.364 |
| 3632.8070000000002 | 35.485 |
| 3633.295 | 37.853 |
| 3633.784 | 37.157 |
| 3634.2720000000004 | 37.146 |
| 3634.7609999999995 | 37.257 |
| 3635.249 | 37.553 |
| 3635.7380000000003 | 37.721 |
| 3636.2259999999997 | 36.137 |
| 3636.7149999999997 | 34.175 |
| 3637.203 | 33.149 |
| 3637.692 | 32.119 |
| 3638.18 | 31.462 |
| 3638.669 | 31.178 |
| 3639.157 | 31.454 |
| 3639.646 | 32.914 |
| 3640.134 | 34.372 |
| 3640.623 | 36.327 |
| 3641.1110000000003 | 38.655 |
| 3641.6000000000004 | 40.917 |
| 3642.0879999999997 | 42.115 |
| 3642.577 | 43.809 |
| 3643.0650000000005 | 44.189 |
| 3643.5539999999996 | 42.754 |
| 3644.042 | 41.315 |
| 3644.531 | 40.875 |
| 3645.019 | 39.056 |
| 3645.508 | 38.235 |
| 3645.996 | 37.411 |
| 3646.485 | 36.46 |
| 3646.974 | 33.255 |
| 3647.462 | 29.486 |
| 3647.951 | 27.089 |
| 3648.4390000000003 | 25.252 |
| 3648.9280000000003 | 22.787 |
| 3649.416 | 19.256 |
| 3649.9049999999997 | 16.724 |
| 3650.393 | 15.875 |
| 3650.8819999999996 | 16.024 |
| 3651.37 | 14.421 |
| 3651.859 | 14.377 |
| 3652.3469999999998 | 16.143 |
| 3652.836 | 19.905 |
| 3653.324 | 22.541 |
| 3653.813 | 24.236 |
| 3654.301 | 25.99 |
| 3654.79 | 29.117 |
| 3655.2780000000002 | 33.304 |
| 3655.7670000000003 | 35.925 |
| 3656.255 | 36.981 |
| 3656.7439999999997 | 38.034 |
| 3657.232 | 37.272 |
| 3657.7210000000005 | 36.569 |
| 3658.209 | 35.489 |
| 3658.698 | 34.906 |
| 3659.186 | 33.632 |
| 3659.6749999999997 | 31.918 |
| 3660.163 | 31.264 |
| 3660.652 | 30.669 |
| 3661.14 | 29.134 |
| 3661.629 | 28.221 |
| 3662.117 | 28.93 |
| 3662.606 | 30.136 |
| 3663.094 | 29.277 |
| 3663.5829999999996 | 26.727 |
| 3664.071 | 24.112 |
| 3664.5600000000004 | 24.244 |
| 3665.048 | 26.186 |
| 3665.537 | 27.312 |
| 3666.026 | 27.497 |
| 3666.514 | 27.805 |
| 3667.003 | 29.922 |
| 3667.491 | 32.349 |
| 3667.98 | 35.085 |
| 3668.468 | 37.568 |
| 3668.957 | 39.861 |
| 3669.445 | 40.838 |
| 3669.934 | 40.75 |
| 3670.4219999999996 | 40.409 |
| 3670.911 | 39.627 |
| 3671.3990000000003 | 38.217 |
| 3671.888 | 37.554 |
| 3672.3759999999997 | 37.263 |
| 3672.865 | 35.469 |
| 3673.353 | 33.235 |
| 3673.842 | 30.56 |
| 3674.33 | 28.006 |
| 3674.819 | 25.825 |
| 3675.3070000000002 | 25.141 |
| 3675.7960000000003 | 23.953 |
| 3676.284 | 22.075 |
| 3676.773 | 21.382 |
| 3677.2609999999995 | 20.873 |
| 3677.75 | 21.048 |
| 3678.2380000000003 | 21.282 |
| 3678.727 | 20.326 |
| 3679.2149999999997 | 18.992 |
| 3679.7039999999997 | 17.592 |
| 3680.192 | 18.064 |
| 3680.681 | 17.845 |
| 3681.169 | 15.436 |
| 3681.658 | 12.335 |
| 3682.146 | 9.67 |
| 3682.635 | 7.313 |
| 3683.123 | 5.078 |
| 3683.612 | 3.216 |
| 3684.1000000000004 | 0.599 |
| 3684.5890000000004 | -3.582 |
| 3685.077 | -9.642 |
| 3685.566 | -15.018 |
| 3686.0550000000003 | -16.835 |
| 3686.5429999999997 | -16.905 |
| 3687.0319999999997 | -18.04 |
| 3687.52 | -20.116 |
| 3688.009 | -21.258 |
| 3688.497 | -21.529 |
| 3688.986 | -21.802 |
| 3689.474 | -21.829 |
| 3689.963 | -19.86 |
| 3690.451 | -17.893 |
| 3690.94 | -16.992 |
| 3691.4280000000003 | -16.657 |
| 3691.9170000000004 | -16.826 |
| 3692.4049999999997 | -17.748 |
| 3692.8940000000002 | -17.36 |
| 3693.3819999999996 | -16.226 |
| 3693.8709999999996 | -15.908 |
| 3694.359 | -16.656 |
| 3694.848 | -17.407 |
| 3695.336 | -17.599 |
| 3695.825 | -15.607 |
| 3696.313 | -15.618 |
| 3696.802 | -16.07 |
| 3697.29 | -15.338 |
| 3697.779 | -14.61 |
| 3698.2670000000003 | -14.509 |
| 3698.7560000000003 | -11.975 |
| 3699.2439999999997 | -8.257 |
| 3699.733 | -7.542 |
| 3700.2210000000005 | -6.831 |
| 3700.71 | -5.185 |
| 3701.198 | -3.356 |
| 3701.687 | -3.53 |
| 3702.1749999999997 | -3.77 |
| 3702.6639999999998 | -4.576 |
| 3703.152 | -5.822 |
| 3703.641 | -7.26 |
| 3704.129 | -8.577 |
| 3704.618 | -10.647 |
| 3705.106 | -12.283 |
| 3705.5950000000003 | -13.172 |
| 3706.0840000000003 | -12.565 |
| 3706.572 | -12.274 |
| 3707.0609999999997 | -11.799 |
| 3707.549 | -10.453 |
| 3708.0380000000005 | -9.923 |
| 3708.526 | -10.271 |
| 3709.015 | -10.435 |
| 3709.503 | -10.103 |
| 3709.9919999999997 | -10.337 |
| 3710.48 | -11.325 |
| 3710.969 | -12.879 |
| 3711.457 | -14.374 |
| 3711.946 | -17.622 |
| 3712.434 | -20.937 |
| 3712.9230000000002 | -23.505 |
| 3713.411 | -25.577 |
| 3713.8999999999996 | -28.59 |
| 3714.388 | -31.356 |
| 3714.8770000000004 | -31.627 |
| 3715.365 | -31.776 |
| 3715.854 | -32.053 |
| 3716.342 | -33.835 |
| 3716.831 | -35.62 |
| 3717.319 | -37.658 |
| 3717.808 | -39.638 |
| 3718.2960000000003 | -41.747 |
| 3718.785 | -45.734 |
| 3719.273 | -49.6 |
| 3719.762 | -52.095 |
| 3720.25 | -54.219 |
| 3720.7389999999996 | -56.784 |
| 3721.227 | -59.227 |
| 3721.7160000000003 | -61.674 |
| 3722.2039999999997 | -63.376 |
| 3722.6929999999998 | -63.893 |
| 3723.181 | -63.914 |
| 3723.67 | -65.127 |
| 3724.158 | -67.03 |
| 3724.647 | -67.688 |
| 3725.135 | -68.162 |
| 3725.6240000000003 | -69.577 |
| 3726.1130000000003 | -71.808 |
| 3726.601 | -74.169 |
| 3727.09 | -75.596 |
| 3727.5779999999995 | -75.026 |
| 3728.067 | -74.023 |
| 3728.5550000000003 | -73.649 |
| 3729.044 | -73.778 |
| 3729.5319999999997 | -73.412 |
| 3730.0209999999997 | -74.049 |
| 3730.509 | -73.566 |
| 3730.998 | -73.586 |
| 3731.486 | -71.485 |
| 3731.975 | -70.513 |
| 3732.463 | -70.795 |
| 3732.952 | -71.206 |
| 3733.44 | -71.933 |
| 3733.929 | -71.602 |
| 3734.4170000000004 | -69.462 |
| 3734.906 | -68.826 |
| 3735.3940000000002 | -69.007 |
| 3735.883 | -69.816 |
| 3736.3709999999996 | -70.193 |
| 3736.8599999999997 | -69.885 |
| 3737.348 | -69.832 |
| 3737.837 | -70.97 |
| 3738.325 | -72.924 |
| 3738.814 | -76.445 |
| 3739.302 | -77.97 |
| 3739.791 | -79.812 |
| 3740.279 | -82.22 |
| 3740.768 | -85.195 |
| 3741.2560000000003 | -87.299 |
| 3741.7450000000003 | -88.969 |
| 3742.233 | -90.456 |
| 3742.7219999999998 | -93.197 |
| 3743.21 | -96.442 |
| 3743.6989999999996 | -99.254 |
| 3744.187 | -101.257 |
| 3744.676 | -103.577 |
| 3745.1639999999998 | -106.589 |
| 3745.653 | -109.917 |
| 3746.142 | -112.999 |
| 3746.63 | -114.648 |
| 3747.119 | -116.676 |
| 3747.607 | -119.145 |
| 3748.096 | -120.932 |
| 3748.5840000000003 | -122.16 |
| 3749.0730000000003 | -121.454 |
| 3749.5609999999997 | -120.191 |
| 3750.05 | -119.181 |
| 3750.5380000000005 | -120.301 |
| 3751.027 | -121.8 |
| 3751.515 | -122.803 |
| 3752.004 | -123.185 |
| 3752.4919999999997 | -124.197 |
| 3752.9809999999998 | -124.65 |
| 3753.469 | -124.795 |
| 3753.958 | -124.319 |
| 3754.446 | -123.286 |
| 3754.935 | -121.881 |
| 3755.4230000000002 | -120.918 |
| 3755.9120000000003 | -120.334 |
| 3756.3999999999996 | -119.38 |
| 3756.889 | -117.68 |
| 3757.3770000000004 | -115.046 |
| 3757.866 | -111.042 |
| 3758.354 | -108.355 |
| 3758.843 | -104.797 |
| 3759.331 | -101.744 |
| 3759.82 | -100.132 |
| 3760.308 | -99.337 |
| 3760.797 | -97.734 |
| 3761.285 | -96.136 |
| 3761.774 | -96.916 |
| 3762.262 | -97.701 |
| 3762.751 | -97.803 |
| 3763.2389999999996 | -98.222 |
| 3763.728 | -99.27 |
| 3764.2160000000003 | -101.323 |
| 3764.705 | -102.818 |
| 3765.1940000000004 | -103.441 |
| 3765.682 | -103.507 |
| 3766.171 | -103.703 |
| 3766.659 | -105.215 |
| 3767.148 | -107.544 |
| 3767.636 | -107.628 |
| 3768.125 | -107.028 |
| 3768.6130000000003 | -106.808 |
| 3769.102 | -107.468 |
| 3769.59 | -107.507 |
| 3770.079 | -107.425 |
| 3770.567 | -107.536 |
| 3771.0559999999996 | -108.463 |
| 3771.544 | -108.833 |
| 3772.0330000000004 | -109.394 |
| 3772.5209999999997 | -109.648 |
| 3773.0099999999998 | -110.031 |
| 3773.498 | -112.856 |
| 3773.987 | -115.748 |
| 3774.475 | -118.02 |
| 3774.964 | -120.859 |
| 3775.452 | -121.702 |
| 3775.9410000000003 | -120.55 |
| 3776.429 | -120.215 |
| 3776.918 | -119.51 |
| 3777.406 | -119.184 |
| 3777.8949999999995 | -119.551 |
| 3778.383 | -118.859 |
| 3778.8720000000003 | -117.86 |
| 3779.3599999999997 | -116.865 |
| 3779.8489999999997 | -115 |
| 3780.337 | -113.139 |
| 3780.826 | -113.034 |
| 3781.314 | -113.995 |
| 3781.803 | -114.773 |
| 3782.291 | -116.244 |
| 3782.78 | -115.907 |
| 3783.268 | -115.449 |
| 3783.757 | -115.872 |
| 3784.2450000000003 | -116.674 |
| 3784.7340000000004 | -116.605 |
| 3785.223 | -115.854 |
| 3785.7110000000002 | -114.92 |
| 3786.2 | -115.554 |
| 3786.6879999999996 | -116.379 |
| 3787.1769999999997 | -117.959 |
| 3787.665 | -118.732 |
| 3788.154 | -117.947 |
| 3788.642 | -117.604 |
| 3789.131 | -117.828 |
| 3789.619 | -117.683 |
| 3790.108 | -118.167 |
| 3790.596 | -117.78 |
| 3791.085 | -117.399 |
| 3791.5730000000003 | -116.147 |
| 3792.0620000000004 | -115.713 |
| 3792.55 | -114.909 |
| 3793.0389999999998 | -114.547 |
| 3793.527 | -115.252 |
| 3794.0159999999996 | -116.712 |
| 3794.504 | -118.552 |
| 3794.993 | -120.147 |
| 3795.4809999999998 | -122.309 |
| 3795.97 | -125.226 |
| 3796.458 | -128.898 |
| 3796.947 | -132.513 |
| 3797.435 | -136.507 |
| 3797.924 | -140.819 |
| 3798.4120000000003 | -143.885 |
| 3798.9010000000003 | -145.269 |
| 3799.389 | -145.283 |
| 3799.8779999999997 | -143.49 |
| 3800.366 | -140.701 |
| 3800.8550000000005 | -137.668 |
| 3801.343 | -133.889 |
| 3801.832 | -130.303 |
| 3802.32 | -126.784 |
| 3802.8089999999997 | -124.895 |
| 3803.297 | -123.074 |
| 3803.786 | -121.883 |
| 3804.274 | -121.134 |
| 3804.763 | -120.828 |
| 3805.252 | -120.152 |
| 3805.7400000000002 | -118.793 |
| 3806.2290000000003 | -117.002 |
| 3806.7169999999996 | -116.654 |
| 3807.206 | -116.935 |
| 3807.6940000000004 | -118.347 |
| 3808.183 | -120.201 |
| 3808.671 | -121.435 |
| 3809.16 | -122.05 |
| 3809.648 | -122.544 |
| 3810.1369999999997 | -123.481 |
| 3810.625 | -124.736 |
| 3811.114 | -124.558 |
| 3811.602 | -121.76 |
| 3812.091 | -118.78 |
| 3812.579 | -115.805 |
| 3813.068 | -114.336 |
| 3813.5559999999996 | -115.309 |
| 3814.045 | -114.974 |
| 3814.5330000000004 | -112.708 |
| 3815.022 | -109.884 |
| 3815.5099999999998 | -107.502 |
| 3815.999 | -106.626 |
| 3816.487 | -105.005 |
| 3816.976 | -102.014 |
| 3817.464 | -97.654 |
| 3817.953 | -93.861 |
| 3818.4410000000003 | -91.324 |
| 3818.93 | -89.729 |
| 3819.418 | -88.952 |
| 3819.907 | -87.117 |
| 3820.3949999999995 | -84.726 |
| 3820.884 | -82.152 |
| 3821.3720000000003 | -79.646 |
| 3821.861 | -78.208 |
| 3822.3489999999997 | -78.087 |
| 3822.8379999999997 | -77.222 |
| 3823.326 | -77.424 |
| 3823.815 | -78.945 |
| 3824.303 | -80.971 |
| 3824.792 | -83.002 |
| 3825.281 | -85.288 |
| 3825.7690000000002 | -88.58 |
| 3826.2580000000003 | -91.627 |
| 3826.746 | -93.867 |
| 3827.235 | -95.425 |
| 3827.723 | -96.988 |
| 3828.2119999999995 | -99.119 |
| 3828.7 | -101.131 |
| 3829.1890000000003 | -103.21 |
| 3829.6769999999997 | -104.42 |
| 3830.1659999999997 | -104.698 |
| 3830.654 | -104.356 |
| 3831.143 | -104.394 |
| 3831.631 | -104.126 |
| 3832.12 | -104.425 |
| 3832.608 | -104.542 |
| 3833.097 | -104.415 |
| 3833.585 | -103.169 |
| 3834.074 | -102.177 |
| 3834.5620000000004 | -102.067 |
| 3835.0510000000004 | -101.836 |
| 3835.5389999999998 | -101.237 |
| 3836.0280000000002 | -100.517 |
| 3836.5159999999996 | -99.491 |
| 3837.0049999999997 | -98.908 |
| 3837.493 | -99.33 |
| 3837.982 | -99.508 |
| 3838.47 | -99.253 |
| 3838.959 | -99.067 |
| 3839.447 | -99.137 |
| 3839.936 | -98.899 |
| 3840.424 | -97.73 |
| 3840.913 | -96.128 |
| 3841.4010000000003 | -95.22 |
| 3841.8900000000003 | -94.63 |
| 3842.3779999999997 | -92.67 |
| 3842.867 | -91.529 |
| 3843.3550000000005 | -89.268 |
| 3843.844 | -87.45 |
| 3844.3329999999996 | -85.513 |
| 3844.821 | -83.269 |
| 3845.31 | -81.218 |
| 3845.798 | -80.173 |
| 3846.287 | -79.508 |
| 3846.775 | -79.85 |
| 3847.264 | -80.321 |
| 3847.752 | -80.611 |
| 3848.241 | -80.782 |
| 3848.7290000000003 | -82.146 |
| 3849.2180000000003 | -84.453 |
| 3849.706 | -85.953 |
| 3850.1949999999997 | -85.834 |
| 3850.683 | -85.846 |
| 3851.1720000000005 | -87.488 |
| 3851.66 | -89.449 |
| 3852.149 | -91.228 |
| 3852.6369999999997 | -92.387 |
| 3853.1259999999997 | -93.365 |
| 3853.614 | -96.162 |
| 3854.103 | -99.776 |
| 3854.591 | -101.896 |
| 3855.08 | -102.648 |
| 3855.568 | -103.217 |
| 3856.0570000000002 | -103.48 |
| 3856.545 | -103.123 |
| 3857.0339999999997 | -103.21 |
| 3857.522 | -103.928 |
| 3858.0110000000004 | -104.089 |
| 3858.499 | -102.693 |
| 3858.988 | -101.866 |
| 3859.476 | -102.544 |
| 3859.965 | -103.979 |
| 3860.453 | -104.856 |
| 3860.942 | -104.303 |
| 3861.43 | -103.005 |
| 3861.919 | -101.963 |
| 3862.407 | -102.051 |
| 3862.896 | -102.021 |
| 3863.384 | -101.184 |
| 3863.8729999999996 | -100.229 |
| 3864.362 | -100.591 |
| 3864.8500000000004 | -102.147 |
| 3865.339 | -105.272 |
| 3865.8269999999998 | -108.277 |
| 3866.316 | -111.038 |
| 3866.804 | -113.243 |
| 3867.293 | -114.267 |
| 3867.781 | -114.921 |
| 3868.27 | -114.706 |
| 3868.7580000000003 | -113.498 |
| 3869.247 | -110.983 |
| 3869.735 | -107.411 |
| 3870.224 | -103.97 |
| 3870.7119999999995 | -100.911 |
| 3871.201 | -98.607 |
| 3871.6890000000003 | -97.06 |
| 3872.178 | -96.643 |
| 3872.6659999999997 | -95.795 |
| 3873.1549999999997 | -94.829 |
| 3873.643 | -94.805 |
| 3874.132 | -95.226 |
| 3874.62 | -94.59 |
| 3875.109 | -94.147 |
| 3875.597 | -93.836 |
| 3876.0860000000002 | -93.405 |
| 3876.574 | -92.169 |
| 3877.063 | -91.251 |
| 3877.5510000000004 | -91.964 |
| 3878.04 | -93.746 |
| 3878.5280000000002 | -95.846 |
| 3879.017 | -96.765 |
| 3879.5049999999997 | -96.753 |
| 3879.9939999999997 | -97.372 |
| 3880.482 | -98.435 |
| 3880.971 | -99.129 |
| 3881.459 | -99.391 |
| 3881.948 | -99.535 |
| 3882.436 | -99.997 |
| 3882.925 | -101.903 |
| 3883.413 | -104.316 |
| 3883.902 | -104.984 |
| 3884.391 | -105.097 |
| 3884.8790000000004 | -104.153 |
| 3885.3680000000004 | -101.84 |
| 3885.8559999999998 | -98.034 |
| 3886.3450000000003 | -94.984 |
| 3886.8329999999996 | -92.752 |
| 3887.3219999999997 | -91.215 |
| 3887.81 | -88.746 |
| 3888.299 | -84.721 |
| 3888.787 | -79.827 |
| 3889.276 | -75.69 |
| 3889.764 | -73.247 |
| 3890.253 | -71.685 |
| 3890.741 | -71.754 |
| 3891.23 | -70.829 |
| 3891.7180000000003 | -70.661 |
| 3892.2070000000003 | -71.124 |
| 3892.6949999999997 | -71.469 |
| 3893.184 | -71.57 |
| 3893.6720000000005 | -72.49 |
| 3894.1609999999996 | -74.166 |
| 3894.649 | -75.911 |
| 3895.138 | -77.725 |
| 3895.6259999999997 | -78.92 |
| 3896.115 | -79.622 |
| 3896.603 | -80.018 |
| 3897.092 | -79.108 |
| 3897.58 | -77.079 |
| 3898.069 | -74.494 |
| 3898.5570000000002 | -71.291 |
| 3899.0460000000003 | -66.594 |
| 3899.5339999999997 | -61.591 |
| 3900.023 | -56.969 |
| 3900.5110000000004 | -54.354 |
| 3901.0 | -52.246 |
| 3901.488 | -50.956 |
| 3901.977 | -49.986 |
| 3902.465 | -49.584 |
| 3902.9539999999997 | -50.752 |
| 3903.442 | -51.363 |
| 3903.931 | -52.294 |
| 3904.42 | -52.793 |
| 3904.908 | -54.299 |
| 3905.397 | -57.562 |
| 3905.885 | -60.581 |
| 3906.3740000000003 | -61.357 |
| 3906.862 | -61.765 |
| 3907.3509999999997 | -62.616 |
| 3907.839 | -62.974 |
| 3908.3280000000004 | -63.339 |
| 3908.816 | -62.773 |
| 3909.305 | -60.339 |
| 3909.793 | -57.411 |
| 3910.282 | -54.739 |
| 3910.77 | -53.325 |
| 3911.259 | -53.167 |
| 3911.747 | -52.89 |
| 3912.236 | -51.621 |
| 3912.724 | -49.92 |
| 3913.213 | -49.476 |
| 3913.701 | -49.039 |
| 3914.1899999999996 | -47.796 |
| 3914.678 | -46.31 |
| 3915.1670000000004 | -45.018 |
| 3915.6549999999997 | -43.608 |
| 3916.144 | -42.641 |
| 3916.632 | -41.432 |
| 3917.121 | -39.604 |
| 3917.609 | -38.159 |
| 3918.098 | -36.469 |
| 3918.5860000000002 | -33.537 |
| 3919.0750000000003 | -30.736 |
| 3919.563 | -28.692 |
| 3920.052 | -27.155 |
| 3920.54 | -25.812 |
| 3921.0289999999995 | -25.101 |
| 3921.517 | -25.147 |
| 3922.0060000000003 | -24.95 |
| 3922.4939999999997 | -24.447 |
| 3922.9829999999997 | -23.888 |
| 3923.471 | -22.086 |
| 3923.96 | -20.728 |
| 3924.449 | -19.565 |
| 3924.937 | -18.846 |
| 3925.426 | -17.759 |
| 3925.914 | -16.054 |
| 3926.4030000000002 | -14.731 |
| 3926.891 | -13.164 |
| 3927.38 | -12.792 |
| 3927.8680000000004 | -13.615 |
| 3928.357 | -15.194 |
| 3928.8450000000003 | -17.592 |
| 3929.334 | -19.373 |
| 3929.8219999999997 | -20.473 |
| 3930.3109999999997 | -20.893 |
| 3930.799 | -22.319 |
| 3931.288 | -23.002 |
| 3931.776 | -23.13 |
| 3932.265 | -21.702 |
| 3932.753 | -19.844 |
| 3933.242 | -18.242 |
| 3933.73 | -17.086 |
| 3934.219 | -15.936 |
| 3934.7070000000003 | -13.605 |
| 3935.1960000000004 | -10.532 |
| 3935.684 | -7.591 |
| 3936.173 | -5.656 |
| 3936.6609999999996 | -3.229 |
| 3937.1499999999996 | -0.871 |
| 3937.638 | 0.854 |
| 3938.127 | 3.511 |
| 3938.615 | 5.285 |
| 3939.104 | 7.489 |
| 3939.592 | 10.249 |
| 3940.081 | 12.065 |
| 3940.569 | 14.873 |
| 3941.058 | 16.05 |
| 3941.5460000000003 | 16.656 |
| 3942.0350000000003 | 15.568 |
| 3942.523 | 14.036 |
| 3943.0119999999997 | 12.059 |
| 3943.501 | 10.137 |
| 3943.9890000000005 | 7.958 |
| 3944.4779999999996 | 5.459 |
| 3944.966 | 4.079 |
| 3945.455 | 3.441 |
| 3945.9429999999998 | 3.171 |
| 3946.432 | 3.206 |
| 3946.92 | 3.484 |
| 3947.409 | 2.568 |
| 3947.897 | 1.644 |
| 3948.386 | 0.338 |
| 3948.8740000000003 | -0.225 |
| 3949.3630000000003 | -0.858 |
| 3949.8509999999997 | -2.31 |
| 3950.34 | -3.395 |
| 3950.8280000000004 | -3.737 |
| 3951.317 | -3.086 |
| 3951.805 | -3.38 |
| 3952.294 | -3.869 |
| 3952.782 | -4.24 |
| 3953.2709999999997 | -4.368 |
| 3953.759 | -3.379 |
| 3954.248 | -1.272 |
| 3954.736 | 1.766 |
| 3955.225 | 4.108 |
| 3955.713 | 6.256 |
| 3956.202 | 8.209 |
| 3956.6899999999996 | 9.967 |
| 3957.179 | 10.968 |
| 3957.6670000000004 | 11.524 |
| 3958.156 | 10.697 |
| 3958.644 | 10.864 |
| 3959.133 | 11.336 |
| 3959.621 | 12.612 |
| 3960.11 | 12.944 |
| 3960.598 | 12.268 |
| 3961.087 | 11.773 |
| 3961.5750000000003 | 11.332 |
| 3962.064 | 10.51 |
| 3962.552 | 11.179 |
| 3963.041 | 12.592 |
| 3963.53 | 14.934 |
| 3964.018 | 18.582 |
| 3964.5069999999996 | 22.035 |
| 3964.995 | 25.355 |
| 3965.4840000000004 | 28.355 |
| 3965.9719999999998 | 30.848 |
| 3966.461 | 31.896 |
| 3966.949 | 33.311 |
| 3967.438 | 33.407 |
| 3967.926 | 33.37 |
| 3968.415 | 33.95 |
| 3968.9030000000002 | 35.023 |
| 3969.3920000000003 | 36.401 |
| 3969.88 | 37.397 |
| 3970.369 | 39.009 |
| 3970.857 | 40.865 |
| 3971.3459999999995 | 42.775 |
| 3971.834 | 43.366 |
| 3972.3230000000003 | 44.699 |
| 3972.8109999999997 | 45.836 |
| 3973.2999999999997 | 46.092 |
| 3973.788 | 44.902 |
| 3974.277 | 44.392 |
| 3974.765 | 44.437 |
| 3975.254 | 44.724 |
| 3975.742 | 44.067 |
| 3976.231 | 43.964 |
| 3976.719 | 45.416 |
| 3977.208 | 46.048 |
| 3977.6960000000004 | 44.548 |
| 3978.1849999999995 | 42.665 |
| 3978.673 | 41.399 |
| 3979.1620000000003 | 41.438 |
| 3979.6499999999996 | 42.094 |
| 3980.1389999999997 | 41.931 |
| 3980.627 | 42.072 |
| 3981.116 | 42.518 |
| 3981.604 | 43.331 |
| 3982.093 | 43.887 |
| 3982.581 | 44.497 |
| 3983.07 | 45.6 |
| 3983.559 | 46.383 |
| 3984.047 | 47.345 |
| 3984.536 | 48.175 |
| 3985.0240000000003 | 48.871 |
| 3985.5130000000004 | 51.185 |
| 3986.001 | 54.055 |
| 3986.49 | 56.541 |
| 3986.9779999999996 | 59.144 |
| 3987.4669999999996 | 61.052 |
| 3987.955 | 62.953 |
| 3988.444 | 64.596 |
| 3988.932 | 66.856 |
| 3989.421 | 67.42 |
| 3989.909 | 68.352 |
| 3990.398 | 69.026 |
| 3990.886 | 69.88 |
| 3991.375 | 71.913 |
| 3991.8630000000003 | 74.689 |
| 3992.3520000000003 | 76.207 |
| 3992.84 | 76.904 |
| 3993.3289999999997 | 79.219 |
| 3993.817 | 81.526 |
| 3994.3060000000005 | 83.137 |
| 3994.794 | 83.991 |
| 3995.283 | 85.087 |
| 3995.7709999999997 | 87.05 |
| 3996.2599999999998 | 89.817 |
| 3996.748 | 92.139 |
| 3997.237 | 93.766 |
| 3997.725 | 94.447 |
| 3998.214 | 95.621 |
| 3998.702 | 95.349 |
| 3999.1910000000003 | 94.944 |
| 3999.679 | 95.406 |
| 4000.1679999999997 | 96.423 |
| 4000.656 | 96.807 |
| 4001.1450000000004 | 97.058 |
| 4001.633 | 97.676 |
| 4002.122 | 98.348 |
| 4002.61 | 99.45 |
| 4003.099 | 99.045 |
| 4003.5879999999997 | 98.881 |
| 4004.076 | 98.772 |
| 4004.565 | 98.967 |
| 4005.053 | 98.529 |
| 4005.542 | 97.396 |
| 4006.03 | 95.067 |
| 4006.5190000000002 | 93.605 |
| 4007.0069999999996 | 92.448 |
| 4007.496 | 90.47 |
| 4007.9840000000004 | 89.484 |
| 4008.473 | 87.865 |
| 4008.961 | 86.8 |
| 4009.45 | 85.603 |
| 4009.938 | 84.772 |
| 4010.427 | 85.246 |
| 4010.915 | 85.087 |
| 4011.404 | 85.732 |
| 4011.8920000000003 | 86.057 |
| 4012.381 | 86.748 |
| 4012.869 | 87.244 |
| 4013.358 | 86.857 |
| 4013.8459999999995 | 86.024 |
| 4014.335 | 85.058 |
| 4014.8230000000003 | 84.271 |
| 4015.312 | 83.727 |
| 4015.7999999999997 | 83.862 |
| 4016.2889999999998 | 83.488 |
| 4016.777 | 83.419 |
| 4017.266 | 83.592 |
| 4017.754 | 83.944 |
| 4018.243 | 84.288 |
| 4018.731 | 83.123 |
| 4019.2200000000003 | 82.701 |
| 4019.708 | 82.583 |
| 4020.197 | 83.019 |
| 4020.6849999999995 | 82.947 |
| 4021.174 | 83.992 |
| 4021.6620000000003 | 85.341 |
| 4022.151 | 87.557 |
| 4022.6400000000003 | 89.452 |
| 4023.1279999999997 | 89.651 |
| 4023.6169999999997 | 88.905 |
| 4024.105 | 89.65 |
| 4024.594 | 90.325 |
| 4025.082 | 92.116 |
| 4025.571 | 92.587 |
| 4026.059 | 94.112 |
| 4026.5480000000002 | 94.566 |
| 4027.036 | 95.574 |
| 4027.525 | 97.074 |
| 4028.0130000000004 | 98.878 |
| 4028.5019999999995 | 100.424 |
| 4028.99 | 101.774 |
| 4029.4790000000003 | 102.428 |
| 4029.9669999999996 | 102.949 |
| 4030.4559999999997 | 103.774 |
| 4030.944 | 104.029 |
| 4031.433 | 102.712 |
| 4031.921 | 101.2 |
| 4032.41 | 99.179 |
| 4032.898 | 98.587 |
| 4033.387 | 99.55 |
| 4033.875 | 101.316 |
| 4034.364 | 103.012 |
| 4034.8520000000003 | 104.325 |
| 4035.3410000000003 | 105.629 |
| 4035.8289999999997 | 107.237 |
| 4036.318 | 111.274 |
| 4036.8060000000005 | 114.553 |
| 4037.2949999999996 | 117.073 |
| 4037.783 | 118.397 |
| 4038.272 | 118.964 |
| 4038.7599999999998 | 119.396 |
| 4039.249 | 119.82 |
| 4039.737 | 120.486 |
| 4040.226 | 121.081 |
| 4040.714 | 121.792 |
| 4041.203 | 121.807 |
| 4041.6910000000003 | 122.127 |
| 4042.1800000000003 | 122.688 |
| 4042.6690000000003 | 123.427 |
| 4043.157 | 122.346 |
| 4043.6459999999997 | 121.757 |
| 4044.134 | 121.221 |
| 4044.6230000000005 | 120.302 |
| 4045.111 | 120.812 |
| 4045.6 | 121.001 |
| 4046.0879999999997 | 121.869 |
| 4046.5769999999998 | 122.165 |
| 4047.065 | 121.704 |
| 4047.554 | 121.171 |
| 4048.042 | 120.255 |
| 4048.531 | 119.767 |
| 4049.0190000000002 | 119.521 |
| 4049.5080000000003 | 119.767 |
| 4049.996 | 119.879 |
| 4050.4849999999997 | 119.607 |
| 4050.973 | 119.514 |
| 4051.4620000000004 | 120.288 |
| 4051.95 | 121.116 |
| 4052.439 | 122.184 |
| 4052.927 | 122.62 |
| 4053.416 | 123.047 |
| 4053.904 | 123.34 |
| 4054.393 | 123.812 |
| 4054.881 | 125.275 |
| 4055.37 | 126.855 |
| 4055.858 | 128.676 |
| 4056.347 | 128.738 |
| 4056.835 | 129.667 |
| 4057.3239999999996 | 130.212 |
| 4057.812 | 130.936 |
| 4058.3010000000004 | 131.089 |
| 4058.7889999999998 | 131.358 |
| 4059.278 | 131.431 |
| 4059.766 | 130.557 |
| 4060.255 | 128.925 |
| 4060.743 | 126.972 |
| 4061.232 | 125.198 |
| 4061.7200000000003 | 124.727 |
| 4062.209 | 124.248 |
| 4062.698 | 124.322 |
| 4063.186 | 124.2 |
| 4063.675 | 122.945 |
| 4064.1629999999996 | 121.743 |
| 4064.652 | 120.657 |
| 4065.1400000000003 | 119.625 |
| 4065.629 | 119.147 |
| 4066.1169999999997 | 118.285 |
| 4066.6059999999998 | 116.79 |
| 4067.094 | 115.348 |
| 4067.583 | 113.772 |
| 4068.071 | 112.375 |
| 4068.56 | 111.157 |
| 4069.0480000000002 | 111.117 |
| 4069.5370000000003 | 110.881 |
| 4070.025 | 111.199 |
| 4070.514 | 110.695 |
| 4071.0019999999995 | 109.246 |
| 4071.491 | 107.787 |
| 4071.9790000000003 | 105.632 |
| 4072.468 | 103.53 |
| 4072.9559999999997 | 101.733 |
| 4073.4449999999997 | 100.114 |
| 4073.933 | 98.986 |
| 4074.422 | 98.099 |
| 4074.91 | 98.453 |
| 4075.399 | 99.736 |
| 4075.887 | 100.323 |
| 4076.376 | 100.15 |
| 4076.864 | 100.344 |
| 4077.353 | 99.966 |
| 4077.8410000000003 | 99.142 |
| 4078.3300000000004 | 98.309 |
| 4078.818 | 98.092 |
| 4079.307 | 97.867 |
| 4079.7949999999996 | 96.382 |
| 4080.2839999999997 | 94.076 |
| 4080.772 | 91.323 |
| 4081.261 | 88.999 |
| 4081.749 | 86.666 |
| 4082.238 | 84.887 |
| 4082.727 | 82.911 |
| 4083.215 | 81.239 |
| 4083.704 | 79.932 |
| 4084.192 | 79.054 |
| 4084.681 | 78.542 |
| 4085.1690000000003 | 78.584 |
| 4085.6580000000004 | 79.429 |
| 4086.1459999999997 | 80.578 |
| 4086.635 | 81.78 |
| 4087.1230000000005 | 83.286 |
| 4087.6119999999996 | 84.47 |
| 4088.1 | 85.52 |
| 4088.589 | 86.874 |
| 4089.0769999999998 | 87.781 |
| 4089.566 | 87.304 |
| 4090.054 | 86.318 |
| 4090.543 | 86.448 |
| 4091.031 | 87.319 |
| 4091.52 | 87.181 |
| 4092.0080000000003 | 85.596 |
| 4092.4970000000003 | 84.127 |
| 4092.9849999999997 | 83.524 |
| 4093.474 | 83.537 |
| 4093.9620000000004 | 83.416 |
| 4094.451 | 83.411 |
| 4094.939 | 83.272 |
| 4095.428 | 83.436 |
| 4095.916 | 83.466 |
| 4096.405 | 82.675 |
| 4096.893 | 81.936 |
| 4097.382 | 79.689 |
| 4097.87 | 77.558 |
| 4098.3589999999995 | 75.542 |
| 4098.847 | 73.705 |
| 4099.336 | 71.546 |
| 4099.824 | 69.878 |
| 4100.313 | 67.389 |
| 4100.801 | 66.64 |
| 4101.29 | 67.632 |
| 4101.778 | 69.052 |
| 4102.267 | 70.463 |
| 4102.756 | 71.053 |
| 4103.244000000001 | 71.383 |
| 4103.733 | 71.517 |
| 4104.221 | 71.266 |
| 4104.71 | 71.444 |
| 4105.197999999999 | 71.675 |
| 4105.687 | 71.772 |
| 4106.175 | 72.297 |
| 4106.664 | 71.813 |
| 4107.152 | 72.757 |
| 4107.641 | 73.38 |
| 4108.129 | 74.993 |
| 4108.618 | 76.034 |
| 4109.106 | 76.191 |
| 4109.595 | 77.339 |
| 4110.0830000000005 | 78.416 |
| 4110.572 | 79.108 |
| 4111.0599999999995 | 80.228 |
| 4111.549 | 80.839 |
| 4112.037 | 81.065 |
| 4112.526 | 80.408 |
| 4113.014 | 79.616 |
| 4113.503 | 77.752 |
| 4113.991 | 75.816 |
| 4114.48 | 73.309 |
| 4114.968 | 70.105 |
| 4115.457 | 66.267 |
| 4115.945 | 63.419 |
| 4116.434 | 60.311 |
| 4116.9220000000005 | 57.445 |
| 4117.411 | 53.257 |
| 4117.898999999999 | 50.434 |
| 4118.388 | 48.54 |
| 4118.876 | 46.136 |
| 4119.365 | 43.473 |
| 4119.853 | 41.05 |
| 4120.342 | 39.494 |
| 4120.83 | 39.24 |
| 4121.3189999999995 | 38.539 |
| 4121.808 | 37.579 |
| 4122.296 | 37.11 |
| 4122.785 | 36.694 |
| 4123.273 | 37.018 |
| 4123.762 | 36.896 |
| 4124.25 | 37.639 |
| 4124.7390000000005 | 38.06 |
| 4125.227 | 36.909 |
| 4125.716 | 35.874 |
| 4126.204 | 34.08 |
| 4126.693 | 32.776 |
| 4127.181 | 31.087 |
| 4127.67 | 29.077 |
| 4128.158 | 27.745 |
| 4128.647 | 27.466 |
| 4129.135 | 26.614 |
| 4129.624 | 25.129 |
| 4130.112 | 23.134 |
| 4130.601 | 21.817 |
| 4131.089 | 22.24 |
| 4131.578 | 22.03 |
| 4132.066 | 20.559 |
| 4132.555 | 19.142 |
| 4133.043 | 17.215 |
| 4133.532 | 14.528 |
| 4134.0199999999995 | 11.458 |
| 4134.509 | 9.315 |
| 4134.997 | 7.662 |
| 4135.486 | 6.313 |
| 4135.974 | 5.267 |
| 4136.463 | 3.898 |
| 4136.951 | 3.02 |
| 4137.4400000000005 | 1.008 |
| 4137.928 | 0.049 |
| 4138.417 | 0.267 |
| 4138.905 | 0.851 |
| 4139.394 | 1.488 |
| 4139.882 | 0.303 |
| 4140.371 | -0.454 |
| 4140.8589999999995 | -0.783 |
| 4141.348 | -1.435 |
| 4141.8369999999995 | -1.908 |
| 4142.325 | -2.891 |
| 4142.814 | -3.883 |
| 4143.302 | -4.885 |
| 4143.791 | -5.335 |
| 4144.279 | -6.418 |
| 4144.768 | -6.949 |
| 4145.256 | -7.364 |
| 4145.745 | -8.539 |
| 4146.233 | -9.786 |
| 4146.722 | -10.293 |
| 4147.21 | -10.435 |
| 4147.6990000000005 | -10.835 |
| 4148.187 | -11.371 |
| 4148.6759999999995 | -12.728 |
| 4149.164 | -14.096 |
| 4149.653 | -16.535 |
| 4150.141 | -17.859 |
| 4150.63 | -18.38 |
| 4151.118 | -18.724 |
| 4151.607 | -19.577 |
| 4152.095 | -20.877 |
| 4152.584 | -22.124 |
| 4153.072 | -23.568 |
| 4153.561000000001 | -25.71 |
| 4154.049 | -28.174 |
| 4154.5380000000005 | -30.773 |
| 4155.026 | -32.881 |
| 4155.514999999999 | -34.686 |
| 4156.003 | -37.126 |
| 4156.492 | -41.013 |
| 4156.98 | -43.847 |
| 4157.469 | -45.191 |
| 4157.957 | -45.358 |
| 4158.446 | -45.346 |
| 4158.934 | -45.532 |
| 4159.423 | -45.79 |
| 4159.911 | -48.37 |
| 4160.400000000001 | -50.772 |
| 4160.888 | -53.622 |
| 4161.377 | -56.544 |
| 4161.866 | -59.163 |
| 4162.354 | -62.292 |
| 4162.843 | -64.555 |
| 4163.331 | -65.266 |
| 4163.82 | -65.674 |
| 4164.308 | -67.092 |
| 4164.797 | -68.832 |
| 4165.285 | -70.144 |
| 4165.774 | -70.278 |
| 4166.262 | -70.548 |
| 4166.751 | -71.639 |
| 4167.2390000000005 | -73.616 |
| 4167.728 | -75.227 |
| 4168.216 | -77.91 |
| 4168.705 | -81.228 |
| 4169.193 | -84.931 |
| 4169.682000000001 | -88.394 |
| 4170.17 | -91.429 |
| 4170.659 | -94.536 |
| 4171.147 | -97.091 |
| 4171.6359999999995 | -98.468 |
| 4172.124 | -98.355 |
| 4172.613 | -97.377 |
| 4173.101 | -98.471 |
| 4173.59 | -100.012 |
| 4174.078 | -102.063 |
| 4174.567 | -104.061 |
| 4175.055 | -104.945 |
| 4175.544 | -105.025 |
| 4176.032 | -104.116 |
| 4176.521000000001 | -103.341 |
| 4177.009 | -103.514 |
| 4177.498 | -104.509 |
| 4177.986 | -104.263 |
| 4178.475 | -102.778 |
| 4178.963 | -101.178 |
| 4179.452 | -100.775 |
| 4179.9400000000005 | -101.756 |
| 4180.429 | -102.248 |
| 4180.917 | -103.375 |
| 4181.406 | -105.699 |
| 4181.895 | -107.47 |
| 4182.383 | -109.376 |
| 4182.871999999999 | -112.417 |
| 4183.360000000001 | -115.906 |
| 4183.849 | -119.654 |
| 4184.3369999999995 | -123.412 |
| 4184.826 | -126.055 |
| 4185.314 | -128.334 |
| 4185.803 | -130.247 |
| 4186.291 | -131.045 |
| 4186.78 | -132.102 |
| 4187.268 | -132.67 |
| 4187.757 | -132.81 |
| 4188.245 | -132.46 |
| 4188.734 | -132.87 |
| 4189.222 | -132.853 |
| 4189.710999999999 | -132.97 |
| 4190.1990000000005 | -132.848 |
| 4190.688 | -133.485 |
| 4191.1759999999995 | -133.632 |
| 4191.665 | -135.289 |
| 4192.153 | -137.519 |
| 4192.642 | -140.509 |
| 4193.13 | -143.571 |
| 4193.619 | -146.33 |
| 4194.107 | -148.225 |
| 4194.5960000000005 | -150.942 |
| 4195.084 | -153.731 |
| 4195.573 | -156.28 |
| 4196.061000000001 | -159.777 |
| 4196.549999999999 | -162.722 |
| 4197.0380000000005 | -166.364 |
| 4197.527 | -169.64 |
| 4198.014999999999 | -172.552 |
| 4198.504 | -175.787 |
| 4198.992 | -178.593 |
| 4199.481 | -181.723 |
| 4199.969 | -185.862 |